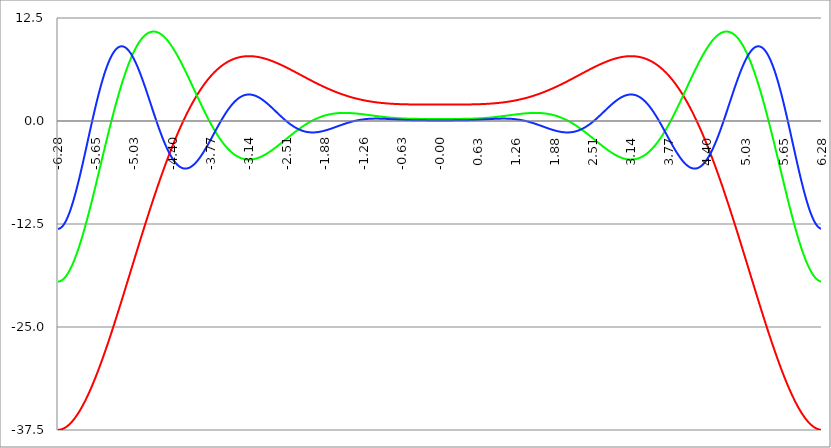
| Category | Series 1 | Series 0 | Series 2 |
|---|---|---|---|
| -6.283185307179586 | -37.478 | -19.489 | -13.085 |
| -6.276902121872407 | -37.478 | -19.488 | -13.083 |
| -6.270618936565228 | -37.475 | -19.483 | -13.076 |
| -6.264335751258049 | -37.471 | -19.475 | -13.064 |
| -6.25805256595087 | -37.466 | -19.464 | -13.048 |
| -6.25176938064369 | -37.459 | -19.451 | -13.027 |
| -6.245486195336511 | -37.451 | -19.434 | -13.002 |
| -6.23920301002933 | -37.441 | -19.414 | -12.972 |
| -6.232919824722153 | -37.429 | -19.391 | -12.938 |
| -6.226636639414973 | -37.416 | -19.365 | -12.899 |
| -6.220353454107794 | -37.402 | -19.336 | -12.855 |
| -6.214070268800615 | -37.386 | -19.304 | -12.808 |
| -6.207787083493435 | -37.368 | -19.269 | -12.756 |
| -6.201503898186257 | -37.349 | -19.231 | -12.699 |
| -6.195220712879077 | -37.329 | -19.19 | -12.638 |
| -6.188937527571898 | -37.307 | -19.147 | -12.573 |
| -6.182654342264719 | -37.283 | -19.1 | -12.504 |
| -6.17637115695754 | -37.258 | -19.051 | -12.431 |
| -6.170087971650361 | -37.232 | -18.998 | -12.353 |
| -6.163804786343182 | -37.204 | -18.943 | -12.271 |
| -6.157521601036002 | -37.175 | -18.885 | -12.186 |
| -6.151238415728823 | -37.145 | -18.825 | -12.096 |
| -6.144955230421644 | -37.113 | -18.761 | -12.002 |
| -6.138672045114464 | -37.079 | -18.695 | -11.905 |
| -6.132388859807286 | -37.045 | -18.626 | -11.803 |
| -6.126105674500106 | -37.008 | -18.555 | -11.698 |
| -6.119822489192927 | -36.971 | -18.481 | -11.589 |
| -6.113539303885748 | -36.932 | -18.404 | -11.477 |
| -6.107256118578569 | -36.892 | -18.324 | -11.361 |
| -6.10097293327139 | -36.85 | -18.242 | -11.241 |
| -6.09468974796421 | -36.807 | -18.158 | -11.117 |
| -6.088406562657031 | -36.762 | -18.071 | -10.991 |
| -6.082123377349852 | -36.717 | -17.981 | -10.86 |
| -6.075840192042672 | -36.67 | -17.889 | -10.727 |
| -6.069557006735494 | -36.621 | -17.794 | -10.59 |
| -6.063273821428314 | -36.571 | -17.697 | -10.45 |
| -6.056990636121135 | -36.52 | -17.597 | -10.307 |
| -6.050707450813956 | -36.468 | -17.495 | -10.161 |
| -6.044424265506777 | -36.414 | -17.391 | -10.012 |
| -6.038141080199597 | -36.359 | -17.284 | -9.859 |
| -6.031857894892418 | -36.303 | -17.175 | -9.704 |
| -6.025574709585239 | -36.246 | -17.064 | -9.546 |
| -6.01929152427806 | -36.187 | -16.951 | -9.386 |
| -6.013008338970881 | -36.127 | -16.835 | -9.223 |
| -6.006725153663701 | -36.066 | -16.717 | -9.057 |
| -6.000441968356522 | -36.003 | -16.597 | -8.888 |
| -5.994158783049343 | -35.939 | -16.474 | -8.717 |
| -5.987875597742164 | -35.875 | -16.35 | -8.544 |
| -5.981592412434984 | -35.808 | -16.223 | -8.368 |
| -5.975309227127805 | -35.741 | -16.095 | -8.19 |
| -5.969026041820626 | -35.672 | -15.964 | -8.01 |
| -5.962742856513447 | -35.603 | -15.832 | -7.828 |
| -5.956459671206268 | -35.532 | -15.697 | -7.644 |
| -5.950176485899088 | -35.46 | -15.561 | -7.458 |
| -5.94389330059191 | -35.386 | -15.422 | -7.27 |
| -5.93761011528473 | -35.312 | -15.282 | -7.08 |
| -5.931326929977551 | -35.236 | -15.14 | -6.889 |
| -5.925043744670372 | -35.159 | -14.996 | -6.695 |
| -5.918760559363193 | -35.082 | -14.85 | -6.501 |
| -5.912477374056014 | -35.003 | -14.703 | -6.305 |
| -5.906194188748834 | -34.922 | -14.554 | -6.107 |
| -5.899911003441655 | -34.841 | -14.403 | -5.908 |
| -5.893627818134476 | -34.759 | -14.25 | -5.708 |
| -5.887344632827297 | -34.675 | -14.096 | -5.506 |
| -5.881061447520117 | -34.591 | -13.94 | -5.304 |
| -5.874778262212938 | -34.505 | -13.783 | -5.1 |
| -5.868495076905759 | -34.419 | -13.624 | -4.896 |
| -5.86221189159858 | -34.331 | -13.464 | -4.69 |
| -5.855928706291401 | -34.242 | -13.302 | -4.484 |
| -5.849645520984221 | -34.152 | -13.139 | -4.277 |
| -5.843362335677042 | -34.062 | -12.974 | -4.07 |
| -5.837079150369863 | -33.97 | -12.808 | -3.862 |
| -5.830795965062684 | -33.877 | -12.641 | -3.653 |
| -5.824512779755505 | -33.783 | -12.472 | -3.444 |
| -5.818229594448325 | -33.688 | -12.302 | -3.235 |
| -5.811946409141146 | -33.592 | -12.131 | -3.025 |
| -5.805663223833967 | -33.495 | -11.959 | -2.816 |
| -5.799380038526788 | -33.398 | -11.786 | -2.606 |
| -5.793096853219609 | -33.299 | -11.611 | -2.396 |
| -5.78681366791243 | -33.199 | -11.435 | -2.186 |
| -5.780530482605251 | -33.098 | -11.259 | -1.977 |
| -5.774247297298071 | -32.997 | -11.081 | -1.767 |
| -5.767964111990892 | -32.894 | -10.902 | -1.558 |
| -5.761680926683713 | -32.791 | -10.722 | -1.349 |
| -5.755397741376534 | -32.686 | -10.542 | -1.141 |
| -5.749114556069355 | -32.581 | -10.36 | -0.933 |
| -5.742831370762175 | -32.475 | -10.178 | -0.726 |
| -5.736548185454996 | -32.368 | -9.994 | -0.519 |
| -5.730265000147816 | -32.26 | -9.81 | -0.313 |
| -5.723981814840638 | -32.151 | -9.626 | -0.108 |
| -5.717698629533459 | -32.042 | -9.44 | 0.096 |
| -5.711415444226279 | -31.931 | -9.254 | 0.299 |
| -5.7051322589191 | -31.82 | -9.067 | 0.502 |
| -5.698849073611921 | -31.708 | -8.88 | 0.703 |
| -5.692565888304742 | -31.595 | -8.692 | 0.903 |
| -5.686282702997562 | -31.481 | -8.503 | 1.102 |
| -5.679999517690383 | -31.366 | -8.314 | 1.299 |
| -5.673716332383204 | -31.251 | -8.124 | 1.496 |
| -5.667433147076025 | -31.135 | -7.934 | 1.691 |
| -5.661149961768846 | -31.018 | -7.743 | 1.884 |
| -5.654866776461667 | -30.9 | -7.553 | 2.076 |
| -5.648583591154487 | -30.782 | -7.361 | 2.266 |
| -5.642300405847308 | -30.662 | -7.17 | 2.455 |
| -5.63601722054013 | -30.542 | -6.978 | 2.642 |
| -5.62973403523295 | -30.422 | -6.786 | 2.827 |
| -5.623450849925771 | -30.3 | -6.593 | 3.01 |
| -5.617167664618591 | -30.178 | -6.401 | 3.191 |
| -5.610884479311412 | -30.055 | -6.208 | 3.371 |
| -5.604601294004233 | -29.932 | -6.015 | 3.548 |
| -5.598318108697054 | -29.807 | -5.822 | 3.724 |
| -5.592034923389875 | -29.683 | -5.629 | 3.897 |
| -5.585751738082695 | -29.557 | -5.436 | 4.068 |
| -5.579468552775516 | -29.431 | -5.243 | 4.237 |
| -5.573185367468337 | -29.304 | -5.05 | 4.403 |
| -5.566902182161157 | -29.176 | -4.858 | 4.568 |
| -5.560618996853979 | -29.048 | -4.665 | 4.73 |
| -5.5543358115468 | -28.919 | -4.472 | 4.889 |
| -5.54805262623962 | -28.79 | -4.28 | 5.046 |
| -5.54176944093244 | -28.66 | -4.087 | 5.201 |
| -5.535486255625262 | -28.529 | -3.895 | 5.353 |
| -5.529203070318083 | -28.398 | -3.703 | 5.502 |
| -5.522919885010904 | -28.266 | -3.512 | 5.649 |
| -5.516636699703724 | -28.134 | -3.32 | 5.793 |
| -5.510353514396545 | -28.001 | -3.13 | 5.934 |
| -5.504070329089366 | -27.868 | -2.939 | 6.072 |
| -5.497787143782186 | -27.734 | -2.749 | 6.208 |
| -5.491503958475008 | -27.599 | -2.559 | 6.341 |
| -5.485220773167828 | -27.464 | -2.37 | 6.471 |
| -5.47893758786065 | -27.328 | -2.181 | 6.598 |
| -5.47265440255347 | -27.192 | -1.993 | 6.722 |
| -5.466371217246291 | -27.056 | -1.805 | 6.843 |
| -5.460088031939112 | -26.919 | -1.618 | 6.961 |
| -5.453804846631932 | -26.781 | -1.432 | 7.077 |
| -5.447521661324753 | -26.643 | -1.246 | 7.189 |
| -5.441238476017574 | -26.504 | -1.061 | 7.298 |
| -5.434955290710395 | -26.365 | -0.876 | 7.404 |
| -5.428672105403215 | -26.226 | -0.693 | 7.506 |
| -5.422388920096036 | -26.086 | -0.509 | 7.606 |
| -5.416105734788857 | -25.946 | -0.327 | 7.702 |
| -5.409822549481678 | -25.805 | -0.146 | 7.795 |
| -5.403539364174499 | -25.664 | 0.035 | 7.885 |
| -5.39725617886732 | -25.522 | 0.215 | 7.972 |
| -5.39097299356014 | -25.38 | 0.394 | 8.056 |
| -5.384689808252961 | -25.238 | 0.572 | 8.136 |
| -5.378406622945782 | -25.095 | 0.749 | 8.213 |
| -5.372123437638603 | -24.952 | 0.925 | 8.287 |
| -5.365840252331424 | -24.809 | 1.1 | 8.357 |
| -5.359557067024244 | -24.665 | 1.274 | 8.424 |
| -5.353273881717065 | -24.521 | 1.447 | 8.488 |
| -5.346990696409886 | -24.376 | 1.619 | 8.548 |
| -5.340707511102707 | -24.231 | 1.79 | 8.605 |
| -5.334424325795528 | -24.086 | 1.96 | 8.659 |
| -5.328141140488348 | -23.941 | 2.129 | 8.709 |
| -5.32185795518117 | -23.795 | 2.296 | 8.756 |
| -5.31557476987399 | -23.649 | 2.463 | 8.8 |
| -5.30929158456681 | -23.503 | 2.628 | 8.84 |
| -5.303008399259631 | -23.356 | 2.792 | 8.877 |
| -5.296725213952453 | -23.209 | 2.955 | 8.911 |
| -5.290442028645273 | -23.062 | 3.117 | 8.941 |
| -5.284158843338094 | -22.914 | 3.277 | 8.968 |
| -5.277875658030915 | -22.767 | 3.436 | 8.992 |
| -5.271592472723735 | -22.619 | 3.594 | 9.012 |
| -5.265309287416557 | -22.471 | 3.75 | 9.029 |
| -5.259026102109377 | -22.322 | 3.905 | 9.043 |
| -5.252742916802198 | -22.174 | 4.059 | 9.053 |
| -5.246459731495019 | -22.025 | 4.211 | 9.06 |
| -5.24017654618784 | -21.876 | 4.362 | 9.064 |
| -5.23389336088066 | -21.727 | 4.511 | 9.064 |
| -5.227610175573481 | -21.578 | 4.659 | 9.062 |
| -5.221326990266302 | -21.428 | 4.806 | 9.056 |
| -5.215043804959122 | -21.279 | 4.951 | 9.047 |
| -5.208760619651944 | -21.129 | 5.094 | 9.034 |
| -5.202477434344764 | -20.979 | 5.236 | 9.019 |
| -5.196194249037585 | -20.829 | 5.377 | 9 |
| -5.189911063730406 | -20.678 | 5.516 | 8.978 |
| -5.183627878423227 | -20.528 | 5.653 | 8.953 |
| -5.177344693116048 | -20.378 | 5.789 | 8.925 |
| -5.171061507808868 | -20.227 | 5.923 | 8.894 |
| -5.164778322501689 | -20.076 | 6.056 | 8.86 |
| -5.15849513719451 | -19.925 | 6.187 | 8.823 |
| -5.152211951887331 | -19.775 | 6.316 | 8.783 |
| -5.145928766580152 | -19.624 | 6.444 | 8.74 |
| -5.139645581272972 | -19.473 | 6.57 | 8.695 |
| -5.133362395965793 | -19.322 | 6.694 | 8.646 |
| -5.127079210658614 | -19.17 | 6.817 | 8.594 |
| -5.120796025351435 | -19.019 | 6.938 | 8.54 |
| -5.114512840044256 | -18.868 | 7.057 | 8.483 |
| -5.108229654737076 | -18.717 | 7.174 | 8.423 |
| -5.101946469429897 | -18.565 | 7.29 | 8.36 |
| -5.095663284122718 | -18.414 | 7.404 | 8.295 |
| -5.08938009881554 | -18.263 | 7.517 | 8.227 |
| -5.08309691350836 | -18.111 | 7.627 | 8.156 |
| -5.07681372820118 | -17.96 | 7.736 | 8.083 |
| -5.070530542894002 | -17.809 | 7.843 | 8.007 |
| -5.064247357586822 | -17.658 | 7.948 | 7.929 |
| -5.057964172279643 | -17.506 | 8.051 | 7.849 |
| -5.051680986972464 | -17.355 | 8.153 | 7.766 |
| -5.045397801665285 | -17.204 | 8.253 | 7.68 |
| -5.039114616358106 | -17.053 | 8.351 | 7.592 |
| -5.032831431050926 | -16.902 | 8.447 | 7.502 |
| -5.026548245743747 | -16.751 | 8.541 | 7.41 |
| -5.020265060436568 | -16.6 | 8.633 | 7.316 |
| -5.013981875129389 | -16.449 | 8.724 | 7.219 |
| -5.00769868982221 | -16.298 | 8.812 | 7.121 |
| -5.00141550451503 | -16.147 | 8.899 | 7.02 |
| -4.995132319207851 | -15.997 | 8.984 | 6.917 |
| -4.98884913390067 | -15.846 | 9.067 | 6.813 |
| -4.982565948593493 | -15.696 | 9.148 | 6.706 |
| -4.976282763286313 | -15.546 | 9.228 | 6.598 |
| -4.969999577979134 | -15.396 | 9.305 | 6.487 |
| -4.963716392671955 | -15.246 | 9.381 | 6.375 |
| -4.957433207364776 | -15.096 | 9.454 | 6.262 |
| -4.951150022057597 | -14.946 | 9.526 | 6.146 |
| -4.944866836750418 | -14.796 | 9.596 | 6.029 |
| -4.938583651443238 | -14.647 | 9.664 | 5.911 |
| -4.932300466136059 | -14.498 | 9.73 | 5.791 |
| -4.92601728082888 | -14.349 | 9.794 | 5.669 |
| -4.9197340955217 | -14.2 | 9.856 | 5.546 |
| -4.913450910214521 | -14.051 | 9.917 | 5.422 |
| -4.907167724907342 | -13.902 | 9.975 | 5.297 |
| -4.900884539600163 | -13.754 | 10.031 | 5.17 |
| -4.894601354292984 | -13.606 | 10.086 | 5.042 |
| -4.888318168985805 | -13.458 | 10.139 | 4.913 |
| -4.882034983678625 | -13.31 | 10.19 | 4.782 |
| -4.875751798371446 | -13.163 | 10.238 | 4.651 |
| -4.869468613064267 | -13.015 | 10.285 | 4.519 |
| -4.863185427757088 | -12.868 | 10.331 | 4.386 |
| -4.856902242449909 | -12.722 | 10.374 | 4.252 |
| -4.85061905714273 | -12.575 | 10.415 | 4.117 |
| -4.84433587183555 | -12.429 | 10.454 | 3.981 |
| -4.838052686528371 | -12.283 | 10.492 | 3.845 |
| -4.831769501221192 | -12.137 | 10.528 | 3.707 |
| -4.825486315914013 | -11.991 | 10.561 | 3.57 |
| -4.819203130606833 | -11.846 | 10.593 | 3.432 |
| -4.812919945299654 | -11.701 | 10.623 | 3.293 |
| -4.806636759992475 | -11.557 | 10.651 | 3.154 |
| -4.800353574685296 | -11.412 | 10.678 | 3.014 |
| -4.794070389378117 | -11.268 | 10.702 | 2.874 |
| -4.787787204070938 | -11.124 | 10.725 | 2.734 |
| -4.781504018763758 | -10.981 | 10.745 | 2.593 |
| -4.77522083345658 | -10.838 | 10.764 | 2.453 |
| -4.7689376481494 | -10.695 | 10.781 | 2.312 |
| -4.762654462842221 | -10.552 | 10.796 | 2.171 |
| -4.756371277535042 | -10.41 | 10.81 | 2.03 |
| -4.750088092227862 | -10.268 | 10.821 | 1.889 |
| -4.743804906920683 | -10.127 | 10.831 | 1.748 |
| -4.737521721613504 | -9.986 | 10.839 | 1.608 |
| -4.731238536306324 | -9.845 | 10.845 | 1.467 |
| -4.724955350999146 | -9.705 | 10.85 | 1.327 |
| -4.718672165691966 | -9.564 | 10.852 | 1.187 |
| -4.712388980384787 | -9.425 | 10.853 | 1.047 |
| -4.706105795077608 | -9.285 | 10.852 | 0.908 |
| -4.699822609770429 | -9.146 | 10.85 | 0.769 |
| -4.69353942446325 | -9.008 | 10.845 | 0.631 |
| -4.68725623915607 | -8.87 | 10.839 | 0.493 |
| -4.680973053848891 | -8.732 | 10.832 | 0.355 |
| -4.674689868541712 | -8.594 | 10.822 | 0.218 |
| -4.668406683234533 | -8.457 | 10.811 | 0.082 |
| -4.662123497927354 | -8.321 | 10.798 | -0.053 |
| -4.655840312620174 | -8.185 | 10.783 | -0.188 |
| -4.649557127312995 | -8.049 | 10.767 | -0.321 |
| -4.643273942005816 | -7.914 | 10.749 | -0.454 |
| -4.636990756698637 | -7.779 | 10.73 | -0.587 |
| -4.630707571391458 | -7.644 | 10.709 | -0.718 |
| -4.624424386084279 | -7.51 | 10.686 | -0.848 |
| -4.618141200777099 | -7.376 | 10.662 | -0.977 |
| -4.61185801546992 | -7.243 | 10.636 | -1.105 |
| -4.605574830162741 | -7.111 | 10.608 | -1.232 |
| -4.599291644855561 | -6.978 | 10.579 | -1.358 |
| -4.593008459548383 | -6.846 | 10.549 | -1.483 |
| -4.586725274241203 | -6.715 | 10.517 | -1.607 |
| -4.580442088934024 | -6.584 | 10.483 | -1.729 |
| -4.574158903626845 | -6.454 | 10.448 | -1.85 |
| -4.567875718319666 | -6.324 | 10.411 | -1.969 |
| -4.561592533012487 | -6.194 | 10.373 | -2.088 |
| -4.555309347705307 | -6.065 | 10.334 | -2.205 |
| -4.549026162398128 | -5.937 | 10.293 | -2.32 |
| -4.542742977090949 | -5.809 | 10.25 | -2.434 |
| -4.53645979178377 | -5.681 | 10.206 | -2.547 |
| -4.530176606476591 | -5.554 | 10.161 | -2.657 |
| -4.523893421169412 | -5.427 | 10.114 | -2.767 |
| -4.517610235862232 | -5.301 | 10.066 | -2.875 |
| -4.511327050555053 | -5.176 | 10.017 | -2.981 |
| -4.505043865247874 | -5.051 | 9.966 | -3.085 |
| -4.498760679940694 | -4.926 | 9.914 | -3.188 |
| -4.492477494633515 | -4.802 | 9.861 | -3.289 |
| -4.486194309326336 | -4.679 | 9.806 | -3.388 |
| -4.479911124019157 | -4.556 | 9.75 | -3.486 |
| -4.473627938711977 | -4.433 | 9.693 | -3.582 |
| -4.467344753404799 | -4.311 | 9.635 | -3.676 |
| -4.46106156809762 | -4.19 | 9.575 | -3.768 |
| -4.45477838279044 | -4.069 | 9.514 | -3.858 |
| -4.44849519748326 | -3.949 | 9.452 | -3.946 |
| -4.442212012176082 | -3.829 | 9.389 | -4.033 |
| -4.435928826868903 | -3.71 | 9.325 | -4.117 |
| -4.429645641561723 | -3.591 | 9.259 | -4.2 |
| -4.423362456254544 | -3.473 | 9.193 | -4.28 |
| -4.417079270947365 | -3.356 | 9.125 | -4.359 |
| -4.410796085640185 | -3.239 | 9.056 | -4.435 |
| -4.404512900333007 | -3.122 | 8.986 | -4.51 |
| -4.398229715025827 | -3.006 | 8.915 | -4.582 |
| -4.391946529718648 | -2.891 | 8.843 | -4.653 |
| -4.38566334441147 | -2.776 | 8.77 | -4.721 |
| -4.37938015910429 | -2.662 | 8.696 | -4.787 |
| -4.373096973797111 | -2.548 | 8.622 | -4.851 |
| -4.366813788489932 | -2.435 | 8.546 | -4.913 |
| -4.360530603182752 | -2.323 | 8.469 | -4.973 |
| -4.354247417875573 | -2.211 | 8.391 | -5.031 |
| -4.347964232568394 | -2.1 | 8.312 | -5.087 |
| -4.341681047261215 | -1.989 | 8.233 | -5.14 |
| -4.335397861954035 | -1.879 | 8.152 | -5.192 |
| -4.329114676646856 | -1.769 | 8.071 | -5.241 |
| -4.322831491339677 | -1.661 | 7.989 | -5.288 |
| -4.316548306032498 | -1.552 | 7.906 | -5.333 |
| -4.310265120725319 | -1.445 | 7.822 | -5.376 |
| -4.30398193541814 | -1.337 | 7.738 | -5.416 |
| -4.29769875011096 | -1.231 | 7.653 | -5.454 |
| -4.291415564803781 | -1.125 | 7.567 | -5.491 |
| -4.285132379496602 | -1.02 | 7.48 | -5.524 |
| -4.278849194189422 | -0.915 | 7.393 | -5.556 |
| -4.272566008882244 | -0.811 | 7.305 | -5.586 |
| -4.266282823575064 | -0.707 | 7.216 | -5.613 |
| -4.259999638267885 | -0.605 | 7.127 | -5.639 |
| -4.253716452960706 | -0.502 | 7.037 | -5.662 |
| -4.247433267653527 | -0.401 | 6.946 | -5.683 |
| -4.241150082346347 | -0.3 | 6.855 | -5.701 |
| -4.234866897039168 | -0.199 | 6.763 | -5.718 |
| -4.228583711731989 | -0.1 | 6.671 | -5.732 |
| -4.22230052642481 | 0 | 6.578 | -5.745 |
| -4.216017341117631 | 0.098 | 6.485 | -5.755 |
| -4.209734155810452 | 0.196 | 6.391 | -5.763 |
| -4.203450970503273 | 0.293 | 6.297 | -5.769 |
| -4.197167785196093 | 0.39 | 6.202 | -5.773 |
| -4.190884599888914 | 0.486 | 6.107 | -5.774 |
| -4.184601414581734 | 0.581 | 6.012 | -5.774 |
| -4.178318229274556 | 0.676 | 5.916 | -5.772 |
| -4.172035043967377 | 0.77 | 5.819 | -5.767 |
| -4.165751858660197 | 0.864 | 5.723 | -5.761 |
| -4.159468673353018 | 0.956 | 5.626 | -5.752 |
| -4.153185488045839 | 1.049 | 5.528 | -5.742 |
| -4.14690230273866 | 1.14 | 5.431 | -5.729 |
| -4.140619117431481 | 1.231 | 5.333 | -5.715 |
| -4.134335932124301 | 1.321 | 5.235 | -5.698 |
| -4.128052746817122 | 1.411 | 5.136 | -5.68 |
| -4.121769561509943 | 1.5 | 5.038 | -5.659 |
| -4.115486376202764 | 1.588 | 4.939 | -5.637 |
| -4.109203190895584 | 1.676 | 4.84 | -5.613 |
| -4.102920005588405 | 1.763 | 4.74 | -5.587 |
| -4.096636820281226 | 1.849 | 4.641 | -5.559 |
| -4.090353634974047 | 1.935 | 4.542 | -5.529 |
| -4.084070449666868 | 2.02 | 4.442 | -5.498 |
| -4.077787264359689 | 2.105 | 4.342 | -5.464 |
| -4.071504079052509 | 2.189 | 4.242 | -5.429 |
| -4.06522089374533 | 2.272 | 4.143 | -5.393 |
| -4.058937708438151 | 2.354 | 4.043 | -5.354 |
| -4.052654523130972 | 2.436 | 3.943 | -5.314 |
| -4.046371337823793 | 2.517 | 3.843 | -5.272 |
| -4.040088152516613 | 2.598 | 3.743 | -5.229 |
| -4.033804967209434 | 2.678 | 3.643 | -5.184 |
| -4.027521781902255 | 2.757 | 3.543 | -5.137 |
| -4.021238596595076 | 2.836 | 3.443 | -5.089 |
| -4.014955411287897 | 2.914 | 3.343 | -5.039 |
| -4.008672225980717 | 2.991 | 3.244 | -4.988 |
| -4.002389040673538 | 3.068 | 3.144 | -4.935 |
| -3.996105855366359 | 3.144 | 3.045 | -4.881 |
| -3.989822670059179 | 3.219 | 2.945 | -4.826 |
| -3.983539484752 | 3.294 | 2.846 | -4.769 |
| -3.97725629944482 | 3.368 | 2.747 | -4.711 |
| -3.97097311413764 | 3.441 | 2.648 | -4.651 |
| -3.96468992883046 | 3.514 | 2.55 | -4.59 |
| -3.958406743523281 | 3.586 | 2.452 | -4.528 |
| -3.952123558216101 | 3.657 | 2.353 | -4.465 |
| -3.945840372908922 | 3.728 | 2.256 | -4.4 |
| -3.939557187601742 | 3.798 | 2.158 | -4.334 |
| -3.933274002294562 | 3.868 | 2.061 | -4.267 |
| -3.926990816987382 | 3.937 | 1.963 | -4.2 |
| -3.920707631680203 | 4.005 | 1.867 | -4.13 |
| -3.914424446373023 | 4.072 | 1.77 | -4.06 |
| -3.908141261065844 | 4.139 | 1.674 | -3.989 |
| -3.901858075758664 | 4.206 | 1.579 | -3.917 |
| -3.895574890451484 | 4.271 | 1.483 | -3.844 |
| -3.889291705144305 | 4.336 | 1.388 | -3.77 |
| -3.883008519837125 | 4.4 | 1.294 | -3.696 |
| -3.876725334529945 | 4.464 | 1.199 | -3.62 |
| -3.870442149222766 | 4.527 | 1.106 | -3.543 |
| -3.864158963915586 | 4.589 | 1.012 | -3.466 |
| -3.857875778608407 | 4.651 | 0.92 | -3.388 |
| -3.851592593301227 | 4.712 | 0.827 | -3.31 |
| -3.845309407994047 | 4.773 | 0.735 | -3.23 |
| -3.839026222686868 | 4.832 | 0.644 | -3.15 |
| -3.832743037379688 | 4.892 | 0.553 | -3.07 |
| -3.826459852072508 | 4.95 | 0.463 | -2.988 |
| -3.820176666765329 | 5.008 | 0.373 | -2.907 |
| -3.813893481458149 | 5.065 | 0.283 | -2.825 |
| -3.807610296150969 | 5.122 | 0.195 | -2.742 |
| -3.80132711084379 | 5.178 | 0.106 | -2.659 |
| -3.79504392553661 | 5.233 | 0.019 | -2.575 |
| -3.78876074022943 | 5.288 | -0.068 | -2.491 |
| -3.782477554922251 | 5.342 | -0.155 | -2.407 |
| -3.776194369615071 | 5.395 | -0.241 | -2.323 |
| -3.769911184307892 | 5.448 | -0.326 | -2.238 |
| -3.763627999000712 | 5.5 | -0.411 | -2.153 |
| -3.757344813693532 | 5.552 | -0.495 | -2.068 |
| -3.751061628386352 | 5.603 | -0.578 | -1.982 |
| -3.744778443079173 | 5.653 | -0.661 | -1.897 |
| -3.738495257771993 | 5.703 | -0.743 | -1.811 |
| -3.732212072464814 | 5.752 | -0.824 | -1.725 |
| -3.725928887157634 | 5.8 | -0.904 | -1.639 |
| -3.719645701850454 | 5.848 | -0.984 | -1.554 |
| -3.713362516543275 | 5.895 | -1.064 | -1.468 |
| -3.707079331236095 | 5.942 | -1.142 | -1.382 |
| -3.700796145928915 | 5.988 | -1.22 | -1.297 |
| -3.694512960621736 | 6.033 | -1.297 | -1.211 |
| -3.688229775314556 | 6.078 | -1.373 | -1.126 |
| -3.681946590007376 | 6.122 | -1.449 | -1.041 |
| -3.675663404700197 | 6.165 | -1.523 | -0.956 |
| -3.669380219393017 | 6.208 | -1.597 | -0.871 |
| -3.663097034085838 | 6.251 | -1.671 | -0.786 |
| -3.656813848778658 | 6.292 | -1.743 | -0.702 |
| -3.650530663471478 | 6.333 | -1.815 | -0.618 |
| -3.644247478164299 | 6.374 | -1.886 | -0.535 |
| -3.63796429285712 | 6.414 | -1.956 | -0.452 |
| -3.631681107549939 | 6.453 | -2.025 | -0.369 |
| -3.62539792224276 | 6.492 | -2.093 | -0.287 |
| -3.61911473693558 | 6.53 | -2.161 | -0.205 |
| -3.612831551628401 | 6.568 | -2.228 | -0.124 |
| -3.606548366321221 | 6.604 | -2.294 | -0.043 |
| -3.600265181014041 | 6.641 | -2.359 | 0.037 |
| -3.593981995706862 | 6.677 | -2.423 | 0.117 |
| -3.587698810399682 | 6.712 | -2.486 | 0.196 |
| -3.581415625092502 | 6.746 | -2.549 | 0.274 |
| -3.575132439785323 | 6.78 | -2.611 | 0.352 |
| -3.568849254478143 | 6.814 | -2.671 | 0.429 |
| -3.562566069170964 | 6.847 | -2.731 | 0.505 |
| -3.556282883863784 | 6.879 | -2.79 | 0.581 |
| -3.549999698556604 | 6.911 | -2.848 | 0.656 |
| -3.543716513249425 | 6.942 | -2.906 | 0.73 |
| -3.537433327942245 | 6.973 | -2.962 | 0.803 |
| -3.531150142635065 | 7.003 | -3.018 | 0.876 |
| -3.524866957327886 | 7.032 | -3.072 | 0.947 |
| -3.518583772020706 | 7.061 | -3.126 | 1.018 |
| -3.512300586713526 | 7.089 | -3.179 | 1.088 |
| -3.506017401406347 | 7.117 | -3.231 | 1.157 |
| -3.499734216099167 | 7.144 | -3.282 | 1.225 |
| -3.493451030791987 | 7.171 | -3.332 | 1.292 |
| -3.487167845484808 | 7.197 | -3.381 | 1.359 |
| -3.480884660177628 | 7.223 | -3.429 | 1.424 |
| -3.474601474870449 | 7.248 | -3.476 | 1.488 |
| -3.468318289563269 | 7.272 | -3.523 | 1.552 |
| -3.462035104256089 | 7.296 | -3.568 | 1.614 |
| -3.45575191894891 | 7.32 | -3.613 | 1.675 |
| -3.44946873364173 | 7.343 | -3.656 | 1.735 |
| -3.44318554833455 | 7.365 | -3.699 | 1.794 |
| -3.436902363027371 | 7.387 | -3.741 | 1.852 |
| -3.430619177720191 | 7.408 | -3.782 | 1.909 |
| -3.424335992413011 | 7.429 | -3.822 | 1.965 |
| -3.418052807105832 | 7.449 | -3.861 | 2.02 |
| -3.411769621798652 | 7.469 | -3.899 | 2.073 |
| -3.405486436491473 | 7.489 | -3.936 | 2.126 |
| -3.399203251184293 | 7.507 | -3.972 | 2.177 |
| -3.392920065877113 | 7.526 | -4.008 | 2.227 |
| -3.386636880569934 | 7.543 | -4.042 | 2.276 |
| -3.380353695262754 | 7.56 | -4.075 | 2.324 |
| -3.374070509955574 | 7.577 | -4.108 | 2.37 |
| -3.367787324648395 | 7.593 | -4.14 | 2.416 |
| -3.361504139341215 | 7.609 | -4.17 | 2.46 |
| -3.355220954034035 | 7.624 | -4.2 | 2.503 |
| -3.348937768726855 | 7.639 | -4.229 | 2.544 |
| -3.342654583419676 | 7.653 | -4.257 | 2.585 |
| -3.336371398112496 | 7.667 | -4.284 | 2.624 |
| -3.330088212805317 | 7.68 | -4.31 | 2.662 |
| -3.323805027498137 | 7.693 | -4.335 | 2.699 |
| -3.317521842190957 | 7.706 | -4.359 | 2.734 |
| -3.311238656883778 | 7.718 | -4.383 | 2.768 |
| -3.304955471576598 | 7.729 | -4.405 | 2.801 |
| -3.298672286269419 | 7.74 | -4.427 | 2.833 |
| -3.292389100962239 | 7.75 | -4.448 | 2.863 |
| -3.286105915655059 | 7.76 | -4.467 | 2.893 |
| -3.27982273034788 | 7.77 | -4.486 | 2.92 |
| -3.2735395450407 | 7.779 | -4.504 | 2.947 |
| -3.26725635973352 | 7.788 | -4.521 | 2.972 |
| -3.260973174426341 | 7.796 | -4.538 | 2.996 |
| -3.254689989119161 | 7.803 | -4.553 | 3.019 |
| -3.248406803811982 | 7.811 | -4.567 | 3.041 |
| -3.242123618504802 | 7.818 | -4.581 | 3.061 |
| -3.235840433197622 | 7.824 | -4.594 | 3.08 |
| -3.229557247890442 | 7.83 | -4.606 | 3.098 |
| -3.223274062583263 | 7.836 | -4.617 | 3.114 |
| -3.216990877276083 | 7.841 | -4.627 | 3.129 |
| -3.210707691968904 | 7.845 | -4.636 | 3.143 |
| -3.204424506661724 | 7.85 | -4.645 | 3.156 |
| -3.198141321354544 | 7.853 | -4.653 | 3.167 |
| -3.191858136047365 | 7.857 | -4.659 | 3.178 |
| -3.185574950740185 | 7.86 | -4.665 | 3.187 |
| -3.179291765433005 | 7.862 | -4.671 | 3.194 |
| -3.173008580125826 | 7.865 | -4.675 | 3.201 |
| -3.166725394818646 | 7.866 | -4.679 | 3.206 |
| -3.160442209511467 | 7.868 | -4.681 | 3.21 |
| -3.154159024204287 | 7.869 | -4.683 | 3.213 |
| -3.147875838897107 | 7.869 | -4.684 | 3.215 |
| -3.141592653589928 | 7.87 | -4.685 | 3.216 |
| -3.135309468282748 | 7.869 | -4.684 | 3.215 |
| -3.129026282975568 | 7.869 | -4.683 | 3.213 |
| -3.122743097668389 | 7.868 | -4.681 | 3.211 |
| -3.116459912361209 | 7.867 | -4.679 | 3.207 |
| -3.110176727054029 | 7.865 | -4.675 | 3.201 |
| -3.10389354174685 | 7.863 | -4.671 | 3.195 |
| -3.09761035643967 | 7.86 | -4.666 | 3.188 |
| -3.09132717113249 | 7.857 | -4.66 | 3.179 |
| -3.085043985825311 | 7.854 | -4.654 | 3.17 |
| -3.078760800518131 | 7.851 | -4.647 | 3.159 |
| -3.072477615210952 | 7.847 | -4.639 | 3.147 |
| -3.066194429903772 | 7.842 | -4.631 | 3.135 |
| -3.059911244596592 | 7.838 | -4.621 | 3.121 |
| -3.053628059289413 | 7.833 | -4.611 | 3.106 |
| -3.047344873982233 | 7.828 | -4.601 | 3.09 |
| -3.041061688675053 | 7.822 | -4.59 | 3.074 |
| -3.034778503367874 | 7.816 | -4.578 | 3.056 |
| -3.028495318060694 | 7.81 | -4.565 | 3.037 |
| -3.022212132753515 | 7.803 | -4.552 | 3.017 |
| -3.015928947446335 | 7.796 | -4.538 | 2.997 |
| -3.009645762139155 | 7.789 | -4.523 | 2.975 |
| -3.003362576831975 | 7.781 | -4.508 | 2.953 |
| -2.997079391524796 | 7.773 | -4.492 | 2.93 |
| -2.990796206217616 | 7.765 | -4.476 | 2.906 |
| -2.984513020910436 | 7.756 | -4.459 | 2.881 |
| -2.978229835603257 | 7.747 | -4.441 | 2.855 |
| -2.971946650296077 | 7.738 | -4.423 | 2.828 |
| -2.965663464988898 | 7.728 | -4.405 | 2.801 |
| -2.959380279681718 | 7.719 | -4.385 | 2.772 |
| -2.953097094374538 | 7.708 | -4.365 | 2.743 |
| -2.946813909067359 | 7.698 | -4.345 | 2.714 |
| -2.94053072376018 | 7.687 | -4.324 | 2.683 |
| -2.934247538453 | 7.676 | -4.302 | 2.652 |
| -2.92796435314582 | 7.665 | -4.28 | 2.62 |
| -2.92168116783864 | 7.653 | -4.258 | 2.588 |
| -2.915397982531461 | 7.642 | -4.235 | 2.555 |
| -2.909114797224281 | 7.63 | -4.211 | 2.521 |
| -2.902831611917101 | 7.617 | -4.187 | 2.486 |
| -2.896548426609922 | 7.605 | -4.162 | 2.451 |
| -2.890265241302742 | 7.592 | -4.137 | 2.416 |
| -2.883982055995562 | 7.578 | -4.112 | 2.379 |
| -2.877698870688383 | 7.565 | -4.086 | 2.343 |
| -2.871415685381203 | 7.551 | -4.059 | 2.305 |
| -2.865132500074023 | 7.537 | -4.032 | 2.267 |
| -2.858849314766844 | 7.523 | -4.005 | 2.229 |
| -2.852566129459664 | 7.509 | -3.977 | 2.19 |
| -2.846282944152485 | 7.494 | -3.949 | 2.151 |
| -2.839999758845305 | 7.479 | -3.921 | 2.112 |
| -2.833716573538125 | 7.464 | -3.892 | 2.072 |
| -2.827433388230946 | 7.448 | -3.863 | 2.031 |
| -2.821150202923766 | 7.433 | -3.833 | 1.99 |
| -2.814867017616586 | 7.417 | -3.803 | 1.949 |
| -2.808583832309407 | 7.401 | -3.772 | 1.908 |
| -2.802300647002227 | 7.385 | -3.741 | 1.866 |
| -2.796017461695047 | 7.368 | -3.71 | 1.824 |
| -2.789734276387867 | 7.351 | -3.679 | 1.781 |
| -2.783451091080688 | 7.334 | -3.647 | 1.739 |
| -2.777167905773509 | 7.317 | -3.615 | 1.696 |
| -2.770884720466329 | 7.3 | -3.582 | 1.652 |
| -2.764601535159149 | 7.282 | -3.55 | 1.609 |
| -2.75831834985197 | 7.264 | -3.517 | 1.566 |
| -2.75203516454479 | 7.246 | -3.483 | 1.522 |
| -2.74575197923761 | 7.228 | -3.45 | 1.478 |
| -2.739468793930431 | 7.21 | -3.416 | 1.434 |
| -2.733185608623251 | 7.191 | -3.382 | 1.39 |
| -2.726902423316071 | 7.173 | -3.348 | 1.346 |
| -2.720619238008892 | 7.154 | -3.313 | 1.301 |
| -2.714336052701712 | 7.135 | -3.278 | 1.257 |
| -2.708052867394532 | 7.115 | -3.243 | 1.213 |
| -2.701769682087352 | 7.096 | -3.208 | 1.168 |
| -2.695486496780173 | 7.076 | -3.173 | 1.124 |
| -2.689203311472993 | 7.057 | -3.137 | 1.079 |
| -2.682920126165814 | 7.037 | -3.101 | 1.035 |
| -2.676636940858634 | 7.016 | -3.065 | 0.991 |
| -2.670353755551454 | 6.996 | -3.029 | 0.946 |
| -2.664070570244275 | 6.976 | -2.993 | 0.902 |
| -2.657787384937095 | 6.955 | -2.956 | 0.858 |
| -2.651504199629916 | 6.934 | -2.919 | 0.814 |
| -2.645221014322736 | 6.914 | -2.883 | 0.77 |
| -2.638937829015556 | 6.893 | -2.846 | 0.726 |
| -2.632654643708377 | 6.871 | -2.809 | 0.683 |
| -2.626371458401197 | 6.85 | -2.772 | 0.639 |
| -2.620088273094018 | 6.829 | -2.735 | 0.596 |
| -2.613805087786838 | 6.807 | -2.697 | 0.553 |
| -2.607521902479658 | 6.786 | -2.66 | 0.51 |
| -2.601238717172478 | 6.764 | -2.622 | 0.468 |
| -2.594955531865299 | 6.742 | -2.585 | 0.425 |
| -2.588672346558119 | 6.72 | -2.547 | 0.383 |
| -2.58238916125094 | 6.698 | -2.51 | 0.342 |
| -2.57610597594376 | 6.675 | -2.472 | 0.3 |
| -2.56982279063658 | 6.653 | -2.434 | 0.259 |
| -2.563539605329401 | 6.63 | -2.396 | 0.218 |
| -2.557256420022221 | 6.608 | -2.358 | 0.177 |
| -2.550973234715042 | 6.585 | -2.321 | 0.137 |
| -2.544690049407862 | 6.562 | -2.283 | 0.097 |
| -2.538406864100682 | 6.539 | -2.245 | 0.058 |
| -2.532123678793503 | 6.516 | -2.207 | 0.018 |
| -2.525840493486323 | 6.493 | -2.169 | -0.02 |
| -2.519557308179143 | 6.47 | -2.132 | -0.059 |
| -2.513274122871964 | 6.447 | -2.094 | -0.097 |
| -2.506990937564784 | 6.423 | -2.056 | -0.134 |
| -2.500707752257604 | 6.4 | -2.018 | -0.171 |
| -2.494424566950425 | 6.376 | -1.981 | -0.208 |
| -2.488141381643245 | 6.353 | -1.943 | -0.244 |
| -2.481858196336065 | 6.329 | -1.906 | -0.28 |
| -2.475575011028886 | 6.305 | -1.868 | -0.315 |
| -2.469291825721706 | 6.281 | -1.831 | -0.35 |
| -2.463008640414527 | 6.258 | -1.794 | -0.384 |
| -2.456725455107347 | 6.234 | -1.756 | -0.418 |
| -2.450442269800167 | 6.21 | -1.719 | -0.451 |
| -2.444159084492988 | 6.186 | -1.682 | -0.484 |
| -2.437875899185808 | 6.161 | -1.645 | -0.516 |
| -2.431592713878628 | 6.137 | -1.609 | -0.548 |
| -2.425309528571449 | 6.113 | -1.572 | -0.579 |
| -2.419026343264269 | 6.089 | -1.535 | -0.61 |
| -2.412743157957089 | 6.064 | -1.499 | -0.64 |
| -2.40645997264991 | 6.04 | -1.463 | -0.67 |
| -2.40017678734273 | 6.016 | -1.427 | -0.699 |
| -2.393893602035551 | 5.991 | -1.391 | -0.727 |
| -2.387610416728371 | 5.967 | -1.355 | -0.755 |
| -2.381327231421191 | 5.942 | -1.319 | -0.783 |
| -2.375044046114012 | 5.917 | -1.284 | -0.809 |
| -2.368760860806832 | 5.893 | -1.248 | -0.835 |
| -2.362477675499652 | 5.868 | -1.213 | -0.861 |
| -2.356194490192473 | 5.844 | -1.178 | -0.886 |
| -2.349911304885293 | 5.819 | -1.143 | -0.91 |
| -2.343628119578113 | 5.794 | -1.109 | -0.934 |
| -2.337344934270934 | 5.769 | -1.074 | -0.957 |
| -2.331061748963754 | 5.745 | -1.04 | -0.98 |
| -2.324778563656574 | 5.72 | -1.006 | -1.002 |
| -2.318495378349395 | 5.695 | -0.972 | -1.023 |
| -2.312212193042215 | 5.67 | -0.939 | -1.044 |
| -2.305929007735036 | 5.646 | -0.905 | -1.064 |
| -2.299645822427856 | 5.621 | -0.872 | -1.083 |
| -2.293362637120676 | 5.596 | -0.839 | -1.102 |
| -2.287079451813496 | 5.571 | -0.807 | -1.121 |
| -2.280796266506317 | 5.547 | -0.774 | -1.138 |
| -2.274513081199137 | 5.522 | -0.742 | -1.155 |
| -2.268229895891957 | 5.497 | -0.71 | -1.172 |
| -2.261946710584778 | 5.472 | -0.678 | -1.187 |
| -2.255663525277598 | 5.447 | -0.647 | -1.203 |
| -2.249380339970419 | 5.423 | -0.616 | -1.217 |
| -2.24309715466324 | 5.398 | -0.585 | -1.231 |
| -2.23681396935606 | 5.373 | -0.554 | -1.244 |
| -2.23053078404888 | 5.348 | -0.524 | -1.257 |
| -2.2242475987417 | 5.324 | -0.494 | -1.269 |
| -2.217964413434521 | 5.299 | -0.464 | -1.281 |
| -2.211681228127341 | 5.274 | -0.434 | -1.292 |
| -2.205398042820161 | 5.25 | -0.405 | -1.302 |
| -2.199114857512981 | 5.225 | -0.376 | -1.312 |
| -2.192831672205802 | 5.201 | -0.347 | -1.321 |
| -2.186548486898622 | 5.176 | -0.319 | -1.329 |
| -2.180265301591443 | 5.152 | -0.29 | -1.337 |
| -2.173982116284263 | 5.127 | -0.262 | -1.344 |
| -2.167698930977084 | 5.103 | -0.235 | -1.351 |
| -2.161415745669904 | 5.078 | -0.208 | -1.357 |
| -2.155132560362724 | 5.054 | -0.181 | -1.363 |
| -2.148849375055545 | 5.03 | -0.154 | -1.368 |
| -2.142566189748365 | 5.005 | -0.127 | -1.372 |
| -2.136283004441185 | 4.981 | -0.101 | -1.376 |
| -2.129999819134006 | 4.957 | -0.076 | -1.38 |
| -2.123716633826826 | 4.933 | -0.05 | -1.382 |
| -2.117433448519646 | 4.909 | -0.025 | -1.385 |
| -2.111150263212467 | 4.885 | 0 | -1.386 |
| -2.104867077905287 | 4.861 | 0.025 | -1.387 |
| -2.098583892598107 | 4.837 | 0.049 | -1.388 |
| -2.092300707290928 | 4.813 | 0.073 | -1.388 |
| -2.086017521983748 | 4.789 | 0.096 | -1.388 |
| -2.079734336676569 | 4.765 | 0.12 | -1.387 |
| -2.073451151369389 | 4.742 | 0.143 | -1.385 |
| -2.06716796606221 | 4.718 | 0.165 | -1.383 |
| -2.06088478075503 | 4.694 | 0.187 | -1.381 |
| -2.05460159544785 | 4.671 | 0.209 | -1.378 |
| -2.04831841014067 | 4.647 | 0.231 | -1.375 |
| -2.042035224833491 | 4.624 | 0.253 | -1.371 |
| -2.035752039526311 | 4.601 | 0.274 | -1.366 |
| -2.029468854219131 | 4.578 | 0.294 | -1.362 |
| -2.023185668911951 | 4.554 | 0.315 | -1.356 |
| -2.016902483604772 | 4.531 | 0.335 | -1.351 |
| -2.010619298297592 | 4.508 | 0.354 | -1.345 |
| -2.004336112990412 | 4.485 | 0.374 | -1.338 |
| -1.998052927683233 | 4.462 | 0.393 | -1.331 |
| -1.991769742376054 | 4.44 | 0.412 | -1.324 |
| -1.985486557068874 | 4.417 | 0.43 | -1.316 |
| -1.979203371761694 | 4.394 | 0.448 | -1.308 |
| -1.972920186454515 | 4.372 | 0.466 | -1.299 |
| -1.966637001147335 | 4.349 | 0.483 | -1.29 |
| -1.960353815840155 | 4.327 | 0.501 | -1.281 |
| -1.954070630532976 | 4.305 | 0.517 | -1.272 |
| -1.947787445225796 | 4.282 | 0.534 | -1.262 |
| -1.941504259918616 | 4.26 | 0.55 | -1.251 |
| -1.935221074611437 | 4.238 | 0.566 | -1.241 |
| -1.928937889304257 | 4.216 | 0.581 | -1.23 |
| -1.922654703997078 | 4.194 | 0.597 | -1.218 |
| -1.916371518689898 | 4.173 | 0.611 | -1.207 |
| -1.910088333382718 | 4.151 | 0.626 | -1.195 |
| -1.903805148075539 | 4.129 | 0.64 | -1.183 |
| -1.897521962768359 | 4.108 | 0.654 | -1.17 |
| -1.891238777461179 | 4.087 | 0.668 | -1.157 |
| -1.884955592154 | 4.065 | 0.681 | -1.144 |
| -1.87867240684682 | 4.044 | 0.694 | -1.131 |
| -1.87238922153964 | 4.023 | 0.707 | -1.118 |
| -1.866106036232461 | 4.002 | 0.719 | -1.104 |
| -1.859822850925281 | 3.981 | 0.731 | -1.09 |
| -1.853539665618102 | 3.96 | 0.743 | -1.076 |
| -1.847256480310922 | 3.94 | 0.754 | -1.061 |
| -1.840973295003742 | 3.919 | 0.765 | -1.047 |
| -1.834690109696563 | 3.899 | 0.776 | -1.032 |
| -1.828406924389383 | 3.878 | 0.787 | -1.017 |
| -1.822123739082203 | 3.858 | 0.797 | -1.002 |
| -1.815840553775024 | 3.838 | 0.807 | -0.987 |
| -1.809557368467844 | 3.818 | 0.816 | -0.971 |
| -1.803274183160664 | 3.798 | 0.826 | -0.956 |
| -1.796990997853485 | 3.778 | 0.835 | -0.94 |
| -1.790707812546305 | 3.758 | 0.843 | -0.924 |
| -1.784424627239125 | 3.739 | 0.852 | -0.908 |
| -1.778141441931946 | 3.719 | 0.86 | -0.892 |
| -1.771858256624766 | 3.7 | 0.868 | -0.876 |
| -1.765575071317587 | 3.681 | 0.875 | -0.86 |
| -1.759291886010407 | 3.661 | 0.883 | -0.843 |
| -1.753008700703227 | 3.642 | 0.89 | -0.827 |
| -1.746725515396048 | 3.623 | 0.896 | -0.81 |
| -1.740442330088868 | 3.605 | 0.903 | -0.794 |
| -1.734159144781688 | 3.586 | 0.909 | -0.777 |
| -1.727875959474509 | 3.567 | 0.915 | -0.76 |
| -1.72159277416733 | 3.549 | 0.921 | -0.744 |
| -1.715309588860149 | 3.531 | 0.926 | -0.727 |
| -1.70902640355297 | 3.512 | 0.931 | -0.71 |
| -1.70274321824579 | 3.494 | 0.936 | -0.693 |
| -1.69646003293861 | 3.476 | 0.941 | -0.676 |
| -1.690176847631431 | 3.458 | 0.945 | -0.66 |
| -1.683893662324251 | 3.441 | 0.949 | -0.643 |
| -1.677610477017072 | 3.423 | 0.953 | -0.626 |
| -1.671327291709892 | 3.405 | 0.957 | -0.609 |
| -1.665044106402712 | 3.388 | 0.96 | -0.592 |
| -1.658760921095533 | 3.371 | 0.963 | -0.576 |
| -1.652477735788353 | 3.354 | 0.966 | -0.559 |
| -1.646194550481173 | 3.337 | 0.969 | -0.542 |
| -1.639911365173994 | 3.32 | 0.971 | -0.526 |
| -1.633628179866814 | 3.303 | 0.973 | -0.509 |
| -1.627344994559634 | 3.286 | 0.975 | -0.493 |
| -1.621061809252455 | 3.27 | 0.977 | -0.477 |
| -1.614778623945275 | 3.253 | 0.979 | -0.46 |
| -1.608495438638096 | 3.237 | 0.98 | -0.444 |
| -1.602212253330916 | 3.221 | 0.981 | -0.428 |
| -1.595929068023736 | 3.205 | 0.982 | -0.412 |
| -1.589645882716557 | 3.189 | 0.983 | -0.396 |
| -1.583362697409377 | 3.173 | 0.983 | -0.38 |
| -1.577079512102197 | 3.157 | 0.984 | -0.365 |
| -1.570796326795018 | 3.142 | 0.984 | -0.349 |
| -1.564513141487838 | 3.126 | 0.984 | -0.334 |
| -1.558229956180659 | 3.111 | 0.983 | -0.318 |
| -1.551946770873479 | 3.096 | 0.983 | -0.303 |
| -1.545663585566299 | 3.081 | 0.982 | -0.288 |
| -1.53938040025912 | 3.066 | 0.981 | -0.273 |
| -1.53309721495194 | 3.051 | 0.98 | -0.258 |
| -1.52681402964476 | 3.036 | 0.979 | -0.244 |
| -1.520530844337581 | 3.022 | 0.978 | -0.229 |
| -1.514247659030401 | 3.007 | 0.976 | -0.215 |
| -1.507964473723221 | 2.993 | 0.974 | -0.201 |
| -1.501681288416042 | 2.979 | 0.973 | -0.187 |
| -1.495398103108862 | 2.965 | 0.971 | -0.173 |
| -1.489114917801682 | 2.951 | 0.968 | -0.16 |
| -1.482831732494503 | 2.937 | 0.966 | -0.146 |
| -1.476548547187323 | 2.923 | 0.964 | -0.133 |
| -1.470265361880144 | 2.909 | 0.961 | -0.12 |
| -1.463982176572964 | 2.896 | 0.958 | -0.107 |
| -1.457698991265784 | 2.883 | 0.955 | -0.094 |
| -1.451415805958605 | 2.869 | 0.952 | -0.082 |
| -1.445132620651425 | 2.856 | 0.949 | -0.07 |
| -1.438849435344245 | 2.843 | 0.946 | -0.057 |
| -1.432566250037066 | 2.831 | 0.942 | -0.046 |
| -1.426283064729886 | 2.818 | 0.939 | -0.034 |
| -1.419999879422706 | 2.805 | 0.935 | -0.022 |
| -1.413716694115527 | 2.793 | 0.931 | -0.011 |
| -1.407433508808347 | 2.781 | 0.927 | 0 |
| -1.401150323501168 | 2.768 | 0.923 | 0.011 |
| -1.394867138193988 | 2.756 | 0.919 | 0.022 |
| -1.388583952886808 | 2.744 | 0.915 | 0.032 |
| -1.382300767579629 | 2.732 | 0.91 | 0.042 |
| -1.376017582272449 | 2.721 | 0.906 | 0.052 |
| -1.369734396965269 | 2.709 | 0.901 | 0.062 |
| -1.36345121165809 | 2.698 | 0.897 | 0.072 |
| -1.35716802635091 | 2.686 | 0.892 | 0.081 |
| -1.35088484104373 | 2.675 | 0.887 | 0.09 |
| -1.344601655736551 | 2.664 | 0.882 | 0.099 |
| -1.338318470429371 | 2.653 | 0.877 | 0.108 |
| -1.332035285122191 | 2.642 | 0.872 | 0.116 |
| -1.325752099815012 | 2.631 | 0.867 | 0.125 |
| -1.319468914507832 | 2.62 | 0.862 | 0.133 |
| -1.313185729200653 | 2.61 | 0.856 | 0.141 |
| -1.306902543893473 | 2.599 | 0.851 | 0.148 |
| -1.300619358586293 | 2.589 | 0.845 | 0.156 |
| -1.294336173279114 | 2.579 | 0.84 | 0.163 |
| -1.288052987971934 | 2.569 | 0.834 | 0.17 |
| -1.281769802664754 | 2.559 | 0.829 | 0.177 |
| -1.275486617357575 | 2.549 | 0.823 | 0.183 |
| -1.269203432050395 | 2.539 | 0.817 | 0.19 |
| -1.262920246743215 | 2.53 | 0.812 | 0.196 |
| -1.256637061436036 | 2.52 | 0.806 | 0.202 |
| -1.250353876128856 | 2.511 | 0.8 | 0.208 |
| -1.244070690821677 | 2.502 | 0.794 | 0.213 |
| -1.237787505514497 | 2.493 | 0.788 | 0.218 |
| -1.231504320207317 | 2.483 | 0.782 | 0.223 |
| -1.225221134900138 | 2.475 | 0.776 | 0.228 |
| -1.218937949592958 | 2.466 | 0.77 | 0.233 |
| -1.212654764285778 | 2.457 | 0.764 | 0.238 |
| -1.206371578978599 | 2.448 | 0.758 | 0.242 |
| -1.20008839367142 | 2.44 | 0.752 | 0.246 |
| -1.193805208364239 | 2.432 | 0.746 | 0.25 |
| -1.18752202305706 | 2.423 | 0.74 | 0.254 |
| -1.18123883774988 | 2.415 | 0.734 | 0.257 |
| -1.1749556524427 | 2.407 | 0.727 | 0.26 |
| -1.168672467135521 | 2.399 | 0.721 | 0.264 |
| -1.162389281828341 | 2.391 | 0.715 | 0.267 |
| -1.156106096521162 | 2.384 | 0.709 | 0.269 |
| -1.149822911213982 | 2.376 | 0.703 | 0.272 |
| -1.143539725906802 | 2.368 | 0.696 | 0.274 |
| -1.137256540599623 | 2.361 | 0.69 | 0.277 |
| -1.130973355292443 | 2.354 | 0.684 | 0.279 |
| -1.124690169985263 | 2.346 | 0.678 | 0.281 |
| -1.118406984678084 | 2.339 | 0.672 | 0.282 |
| -1.112123799370904 | 2.332 | 0.665 | 0.284 |
| -1.105840614063724 | 2.325 | 0.659 | 0.285 |
| -1.099557428756545 | 2.319 | 0.653 | 0.287 |
| -1.093274243449365 | 2.312 | 0.647 | 0.288 |
| -1.086991058142186 | 2.305 | 0.641 | 0.289 |
| -1.080707872835006 | 2.299 | 0.635 | 0.29 |
| -1.074424687527826 | 2.292 | 0.629 | 0.29 |
| -1.068141502220647 | 2.286 | 0.623 | 0.291 |
| -1.061858316913467 | 2.28 | 0.617 | 0.291 |
| -1.055575131606287 | 2.274 | 0.611 | 0.291 |
| -1.049291946299108 | 2.267 | 0.605 | 0.291 |
| -1.043008760991928 | 2.262 | 0.599 | 0.291 |
| -1.036725575684748 | 2.256 | 0.593 | 0.291 |
| -1.030442390377569 | 2.25 | 0.587 | 0.291 |
| -1.024159205070389 | 2.244 | 0.581 | 0.291 |
| -1.01787601976321 | 2.239 | 0.575 | 0.29 |
| -1.01159283445603 | 2.233 | 0.569 | 0.289 |
| -1.00530964914885 | 2.228 | 0.564 | 0.289 |
| -0.999026463841671 | 2.222 | 0.558 | 0.288 |
| -0.992743278534491 | 2.217 | 0.552 | 0.287 |
| -0.986460093227311 | 2.212 | 0.546 | 0.286 |
| -0.980176907920132 | 2.207 | 0.541 | 0.285 |
| -0.973893722612952 | 2.202 | 0.535 | 0.283 |
| -0.967610537305772 | 2.197 | 0.53 | 0.282 |
| -0.961327351998593 | 2.192 | 0.524 | 0.281 |
| -0.955044166691413 | 2.188 | 0.519 | 0.279 |
| -0.948760981384233 | 2.183 | 0.513 | 0.278 |
| -0.942477796077054 | 2.178 | 0.508 | 0.276 |
| -0.936194610769874 | 2.174 | 0.503 | 0.274 |
| -0.929911425462695 | 2.17 | 0.498 | 0.272 |
| -0.923628240155515 | 2.165 | 0.492 | 0.27 |
| -0.917345054848335 | 2.161 | 0.487 | 0.268 |
| -0.911061869541156 | 2.157 | 0.482 | 0.266 |
| -0.904778684233976 | 2.153 | 0.477 | 0.264 |
| -0.898495498926796 | 2.149 | 0.472 | 0.262 |
| -0.892212313619617 | 2.145 | 0.467 | 0.26 |
| -0.885929128312437 | 2.141 | 0.462 | 0.258 |
| -0.879645943005257 | 2.137 | 0.458 | 0.255 |
| -0.873362757698078 | 2.133 | 0.453 | 0.253 |
| -0.867079572390898 | 2.13 | 0.448 | 0.251 |
| -0.860796387083718 | 2.126 | 0.444 | 0.248 |
| -0.854513201776539 | 2.123 | 0.439 | 0.246 |
| -0.848230016469359 | 2.119 | 0.435 | 0.243 |
| -0.84194683116218 | 2.116 | 0.43 | 0.24 |
| -0.835663645855 | 2.113 | 0.426 | 0.238 |
| -0.82938046054782 | 2.109 | 0.421 | 0.235 |
| -0.823097275240641 | 2.106 | 0.417 | 0.233 |
| -0.816814089933461 | 2.103 | 0.413 | 0.23 |
| -0.810530904626281 | 2.1 | 0.409 | 0.227 |
| -0.804247719319102 | 2.097 | 0.405 | 0.225 |
| -0.797964534011922 | 2.094 | 0.401 | 0.222 |
| -0.791681348704742 | 2.092 | 0.397 | 0.219 |
| -0.785398163397563 | 2.089 | 0.393 | 0.216 |
| -0.779114978090383 | 2.086 | 0.389 | 0.214 |
| -0.772831792783204 | 2.083 | 0.385 | 0.211 |
| -0.766548607476024 | 2.081 | 0.381 | 0.208 |
| -0.760265422168844 | 2.078 | 0.378 | 0.205 |
| -0.753982236861665 | 2.076 | 0.374 | 0.203 |
| -0.747699051554485 | 2.073 | 0.371 | 0.2 |
| -0.741415866247305 | 2.071 | 0.367 | 0.197 |
| -0.735132680940126 | 2.069 | 0.364 | 0.194 |
| -0.728849495632946 | 2.066 | 0.36 | 0.192 |
| -0.722566310325766 | 2.064 | 0.357 | 0.189 |
| -0.716283125018587 | 2.062 | 0.354 | 0.186 |
| -0.709999939711407 | 2.06 | 0.351 | 0.184 |
| -0.703716754404227 | 2.058 | 0.348 | 0.181 |
| -0.697433569097048 | 2.056 | 0.345 | 0.178 |
| -0.691150383789868 | 2.054 | 0.342 | 0.176 |
| -0.684867198482689 | 2.052 | 0.339 | 0.173 |
| -0.678584013175509 | 2.05 | 0.336 | 0.17 |
| -0.672300827868329 | 2.049 | 0.333 | 0.168 |
| -0.66601764256115 | 2.047 | 0.33 | 0.165 |
| -0.65973445725397 | 2.045 | 0.328 | 0.163 |
| -0.65345127194679 | 2.043 | 0.325 | 0.16 |
| -0.647168086639611 | 2.042 | 0.322 | 0.158 |
| -0.640884901332431 | 2.04 | 0.32 | 0.155 |
| -0.634601716025251 | 2.039 | 0.317 | 0.153 |
| -0.628318530718072 | 2.037 | 0.315 | 0.151 |
| -0.622035345410892 | 2.036 | 0.313 | 0.148 |
| -0.615752160103712 | 2.034 | 0.31 | 0.146 |
| -0.609468974796533 | 2.033 | 0.308 | 0.144 |
| -0.603185789489353 | 2.032 | 0.306 | 0.141 |
| -0.596902604182174 | 2.03 | 0.304 | 0.139 |
| -0.590619418874994 | 2.029 | 0.302 | 0.137 |
| -0.584336233567814 | 2.028 | 0.3 | 0.135 |
| -0.578053048260635 | 2.027 | 0.298 | 0.133 |
| -0.571769862953455 | 2.026 | 0.296 | 0.131 |
| -0.565486677646275 | 2.025 | 0.294 | 0.129 |
| -0.559203492339096 | 2.024 | 0.292 | 0.127 |
| -0.552920307031916 | 2.023 | 0.291 | 0.125 |
| -0.546637121724737 | 2.022 | 0.289 | 0.123 |
| -0.540353936417557 | 2.021 | 0.287 | 0.121 |
| -0.534070751110377 | 2.02 | 0.286 | 0.119 |
| -0.527787565803198 | 2.019 | 0.284 | 0.118 |
| -0.521504380496018 | 2.018 | 0.283 | 0.116 |
| -0.515221195188838 | 2.017 | 0.281 | 0.114 |
| -0.508938009881659 | 2.016 | 0.28 | 0.112 |
| -0.502654824574479 | 2.016 | 0.278 | 0.111 |
| -0.496371639267299 | 2.015 | 0.277 | 0.109 |
| -0.49008845396012 | 2.014 | 0.276 | 0.108 |
| -0.48380526865294 | 2.013 | 0.275 | 0.106 |
| -0.477522083345761 | 2.013 | 0.273 | 0.105 |
| -0.471238898038581 | 2.012 | 0.272 | 0.103 |
| -0.464955712731402 | 2.011 | 0.271 | 0.102 |
| -0.458672527424222 | 2.011 | 0.27 | 0.101 |
| -0.452389342117042 | 2.01 | 0.269 | 0.099 |
| -0.446106156809863 | 2.01 | 0.268 | 0.098 |
| -0.439822971502683 | 2.009 | 0.267 | 0.097 |
| -0.433539786195504 | 2.009 | 0.266 | 0.096 |
| -0.427256600888324 | 2.008 | 0.265 | 0.095 |
| -0.420973415581144 | 2.008 | 0.264 | 0.094 |
| -0.414690230273965 | 2.007 | 0.264 | 0.093 |
| -0.408407044966785 | 2.007 | 0.263 | 0.092 |
| -0.402123859659606 | 2.006 | 0.262 | 0.091 |
| -0.395840674352426 | 2.006 | 0.261 | 0.09 |
| -0.389557489045247 | 2.006 | 0.261 | 0.089 |
| -0.383274303738067 | 2.005 | 0.26 | 0.088 |
| -0.376991118430887 | 2.005 | 0.259 | 0.087 |
| -0.370707933123708 | 2.005 | 0.259 | 0.086 |
| -0.364424747816528 | 2.004 | 0.258 | 0.086 |
| -0.358141562509349 | 2.004 | 0.258 | 0.085 |
| -0.351858377202169 | 2.004 | 0.257 | 0.084 |
| -0.345575191894989 | 2.004 | 0.257 | 0.084 |
| -0.33929200658781 | 2.003 | 0.256 | 0.083 |
| -0.33300882128063 | 2.003 | 0.256 | 0.082 |
| -0.326725635973451 | 2.003 | 0.255 | 0.082 |
| -0.320442450666271 | 2.003 | 0.255 | 0.081 |
| -0.314159265359092 | 2.002 | 0.255 | 0.081 |
| -0.307876080051912 | 2.002 | 0.254 | 0.08 |
| -0.301592894744732 | 2.002 | 0.254 | 0.08 |
| -0.295309709437553 | 2.002 | 0.254 | 0.079 |
| -0.289026524130373 | 2.002 | 0.253 | 0.079 |
| -0.282743338823194 | 2.002 | 0.253 | 0.078 |
| -0.276460153516014 | 2.001 | 0.253 | 0.078 |
| -0.270176968208834 | 2.001 | 0.253 | 0.078 |
| -0.263893782901655 | 2.001 | 0.252 | 0.077 |
| -0.257610597594475 | 2.001 | 0.252 | 0.077 |
| -0.251327412287296 | 2.001 | 0.252 | 0.077 |
| -0.245044226980116 | 2.001 | 0.252 | 0.077 |
| -0.238761041672937 | 2.001 | 0.252 | 0.076 |
| -0.232477856365757 | 2.001 | 0.251 | 0.076 |
| -0.226194671058577 | 2.001 | 0.251 | 0.076 |
| -0.219911485751398 | 2.001 | 0.251 | 0.076 |
| -0.213628300444218 | 2.001 | 0.251 | 0.076 |
| -0.207345115137039 | 2 | 0.251 | 0.075 |
| -0.201061929829859 | 2 | 0.251 | 0.075 |
| -0.194778744522679 | 2 | 0.251 | 0.075 |
| -0.1884955592155 | 2 | 0.251 | 0.075 |
| -0.18221237390832 | 2 | 0.251 | 0.075 |
| -0.175929188601141 | 2 | 0.25 | 0.075 |
| -0.169646003293961 | 2 | 0.25 | 0.075 |
| -0.163362817986782 | 2 | 0.25 | 0.075 |
| -0.157079632679602 | 2 | 0.25 | 0.075 |
| -0.150796447372422 | 2 | 0.25 | 0.074 |
| -0.144513262065243 | 2 | 0.25 | 0.074 |
| -0.138230076758063 | 2 | 0.25 | 0.074 |
| -0.131946891450884 | 2 | 0.25 | 0.074 |
| -0.125663706143704 | 2 | 0.25 | 0.074 |
| -0.119380520836524 | 2 | 0.25 | 0.074 |
| -0.113097335529345 | 2 | 0.25 | 0.074 |
| -0.106814150222165 | 2 | 0.25 | 0.074 |
| -0.100530964914986 | 2 | 0.25 | 0.074 |
| -0.0942477796078061 | 2 | 0.25 | 0.074 |
| -0.0879645943006265 | 2 | 0.25 | 0.074 |
| -0.0816814089934469 | 2 | 0.25 | 0.074 |
| -0.0753982236862674 | 2 | 0.25 | 0.074 |
| -0.0691150383790878 | 2 | 0.25 | 0.074 |
| -0.0628318530719082 | 2 | 0.25 | 0.074 |
| -0.0565486677647286 | 2 | 0.25 | 0.074 |
| -0.050265482457549 | 2 | 0.25 | 0.074 |
| -0.0439822971503694 | 2 | 0.25 | 0.074 |
| -0.0376991118431899 | 2 | 0.25 | 0.074 |
| -0.0314159265360103 | 2 | 0.25 | 0.074 |
| -0.0251327412288307 | 2 | 0.25 | 0.074 |
| -0.0188495559216511 | 2 | 0.25 | 0.074 |
| -0.0125663706144715 | 2 | 0.25 | 0.074 |
| -0.00628318530729192 | 2 | 0.25 | 0.074 |
| -1.12338957580782e-13 | 2 | 0.25 | 0.074 |
| 0.00628318530706725 | 2 | 0.25 | 0.074 |
| 0.0125663706142468 | 2 | 0.25 | 0.074 |
| 0.0188495559214264 | 2 | 0.25 | 0.074 |
| 0.025132741228606 | 2 | 0.25 | 0.074 |
| 0.0314159265357856 | 2 | 0.25 | 0.074 |
| 0.0376991118429652 | 2 | 0.25 | 0.074 |
| 0.0439822971501448 | 2 | 0.25 | 0.074 |
| 0.0502654824573243 | 2 | 0.25 | 0.074 |
| 0.0565486677645039 | 2 | 0.25 | 0.074 |
| 0.0628318530716835 | 2 | 0.25 | 0.074 |
| 0.0691150383788631 | 2 | 0.25 | 0.074 |
| 0.0753982236860427 | 2 | 0.25 | 0.074 |
| 0.0816814089932222 | 2 | 0.25 | 0.074 |
| 0.0879645943004018 | 2 | 0.25 | 0.074 |
| 0.0942477796075814 | 2 | 0.25 | 0.074 |
| 0.100530964914761 | 2 | 0.25 | 0.074 |
| 0.106814150221941 | 2 | 0.25 | 0.074 |
| 0.11309733552912 | 2 | 0.25 | 0.074 |
| 0.1193805208363 | 2 | 0.25 | 0.074 |
| 0.125663706143479 | 2 | 0.25 | 0.074 |
| 0.131946891450659 | 2 | 0.25 | 0.074 |
| 0.138230076757839 | 2 | 0.25 | 0.074 |
| 0.144513262065018 | 2 | 0.25 | 0.074 |
| 0.150796447372198 | 2 | 0.25 | 0.074 |
| 0.157079632679377 | 2 | 0.25 | 0.075 |
| 0.163362817986557 | 2 | 0.25 | 0.075 |
| 0.169646003293736 | 2 | 0.25 | 0.075 |
| 0.175929188600916 | 2 | 0.25 | 0.075 |
| 0.182212373908096 | 2 | 0.251 | 0.075 |
| 0.188495559215275 | 2 | 0.251 | 0.075 |
| 0.194778744522455 | 2 | 0.251 | 0.075 |
| 0.201061929829634 | 2 | 0.251 | 0.075 |
| 0.207345115136814 | 2 | 0.251 | 0.075 |
| 0.213628300443994 | 2.001 | 0.251 | 0.076 |
| 0.219911485751173 | 2.001 | 0.251 | 0.076 |
| 0.226194671058353 | 2.001 | 0.251 | 0.076 |
| 0.232477856365532 | 2.001 | 0.251 | 0.076 |
| 0.238761041672712 | 2.001 | 0.252 | 0.076 |
| 0.245044226979891 | 2.001 | 0.252 | 0.077 |
| 0.251327412287071 | 2.001 | 0.252 | 0.077 |
| 0.257610597594251 | 2.001 | 0.252 | 0.077 |
| 0.26389378290143 | 2.001 | 0.252 | 0.077 |
| 0.27017696820861 | 2.001 | 0.253 | 0.078 |
| 0.276460153515789 | 2.001 | 0.253 | 0.078 |
| 0.282743338822969 | 2.002 | 0.253 | 0.078 |
| 0.289026524130149 | 2.002 | 0.253 | 0.079 |
| 0.295309709437328 | 2.002 | 0.254 | 0.079 |
| 0.301592894744508 | 2.002 | 0.254 | 0.08 |
| 0.307876080051687 | 2.002 | 0.254 | 0.08 |
| 0.314159265358867 | 2.002 | 0.255 | 0.081 |
| 0.320442450666046 | 2.003 | 0.255 | 0.081 |
| 0.326725635973226 | 2.003 | 0.255 | 0.082 |
| 0.333008821280406 | 2.003 | 0.256 | 0.082 |
| 0.339292006587585 | 2.003 | 0.256 | 0.083 |
| 0.345575191894765 | 2.004 | 0.257 | 0.084 |
| 0.351858377201944 | 2.004 | 0.257 | 0.084 |
| 0.358141562509124 | 2.004 | 0.258 | 0.085 |
| 0.364424747816304 | 2.004 | 0.258 | 0.086 |
| 0.370707933123483 | 2.005 | 0.259 | 0.086 |
| 0.376991118430663 | 2.005 | 0.259 | 0.087 |
| 0.383274303737842 | 2.005 | 0.26 | 0.088 |
| 0.389557489045022 | 2.006 | 0.261 | 0.089 |
| 0.395840674352201 | 2.006 | 0.261 | 0.09 |
| 0.402123859659381 | 2.006 | 0.262 | 0.091 |
| 0.408407044966561 | 2.007 | 0.263 | 0.092 |
| 0.41469023027374 | 2.007 | 0.264 | 0.093 |
| 0.42097341558092 | 2.008 | 0.264 | 0.094 |
| 0.427256600888099 | 2.008 | 0.265 | 0.095 |
| 0.433539786195279 | 2.009 | 0.266 | 0.096 |
| 0.439822971502459 | 2.009 | 0.267 | 0.097 |
| 0.446106156809638 | 2.01 | 0.268 | 0.098 |
| 0.452389342116818 | 2.01 | 0.269 | 0.099 |
| 0.458672527423997 | 2.011 | 0.27 | 0.101 |
| 0.464955712731177 | 2.011 | 0.271 | 0.102 |
| 0.471238898038356 | 2.012 | 0.272 | 0.103 |
| 0.477522083345536 | 2.013 | 0.273 | 0.105 |
| 0.483805268652716 | 2.013 | 0.275 | 0.106 |
| 0.490088453959895 | 2.014 | 0.276 | 0.108 |
| 0.496371639267075 | 2.015 | 0.277 | 0.109 |
| 0.502654824574254 | 2.016 | 0.278 | 0.111 |
| 0.508938009881434 | 2.016 | 0.28 | 0.112 |
| 0.515221195188614 | 2.017 | 0.281 | 0.114 |
| 0.521504380495793 | 2.018 | 0.283 | 0.116 |
| 0.527787565802973 | 2.019 | 0.284 | 0.118 |
| 0.534070751110153 | 2.02 | 0.286 | 0.119 |
| 0.540353936417332 | 2.021 | 0.287 | 0.121 |
| 0.546637121724512 | 2.022 | 0.289 | 0.123 |
| 0.552920307031692 | 2.023 | 0.291 | 0.125 |
| 0.559203492338871 | 2.024 | 0.292 | 0.127 |
| 0.565486677646051 | 2.025 | 0.294 | 0.129 |
| 0.571769862953231 | 2.026 | 0.296 | 0.131 |
| 0.57805304826041 | 2.027 | 0.298 | 0.133 |
| 0.58433623356759 | 2.028 | 0.3 | 0.135 |
| 0.590619418874769 | 2.029 | 0.302 | 0.137 |
| 0.596902604181949 | 2.03 | 0.304 | 0.139 |
| 0.603185789489129 | 2.032 | 0.306 | 0.141 |
| 0.609468974796308 | 2.033 | 0.308 | 0.144 |
| 0.615752160103488 | 2.034 | 0.31 | 0.146 |
| 0.622035345410668 | 2.036 | 0.313 | 0.148 |
| 0.628318530717847 | 2.037 | 0.315 | 0.151 |
| 0.634601716025027 | 2.039 | 0.317 | 0.153 |
| 0.640884901332206 | 2.04 | 0.32 | 0.155 |
| 0.647168086639386 | 2.042 | 0.322 | 0.158 |
| 0.653451271946566 | 2.043 | 0.325 | 0.16 |
| 0.659734457253745 | 2.045 | 0.328 | 0.163 |
| 0.666017642560925 | 2.047 | 0.33 | 0.165 |
| 0.672300827868105 | 2.049 | 0.333 | 0.168 |
| 0.678584013175284 | 2.05 | 0.336 | 0.17 |
| 0.684867198482464 | 2.052 | 0.339 | 0.173 |
| 0.691150383789644 | 2.054 | 0.342 | 0.176 |
| 0.697433569096823 | 2.056 | 0.345 | 0.178 |
| 0.703716754404003 | 2.058 | 0.348 | 0.181 |
| 0.709999939711183 | 2.06 | 0.351 | 0.184 |
| 0.716283125018362 | 2.062 | 0.354 | 0.186 |
| 0.722566310325542 | 2.064 | 0.357 | 0.189 |
| 0.728849495632721 | 2.066 | 0.36 | 0.192 |
| 0.735132680939901 | 2.069 | 0.364 | 0.194 |
| 0.741415866247081 | 2.071 | 0.367 | 0.197 |
| 0.74769905155426 | 2.073 | 0.371 | 0.2 |
| 0.75398223686144 | 2.076 | 0.374 | 0.203 |
| 0.76026542216862 | 2.078 | 0.378 | 0.205 |
| 0.766548607475799 | 2.081 | 0.381 | 0.208 |
| 0.772831792782979 | 2.083 | 0.385 | 0.211 |
| 0.779114978090159 | 2.086 | 0.389 | 0.214 |
| 0.785398163397338 | 2.089 | 0.393 | 0.216 |
| 0.791681348704518 | 2.092 | 0.397 | 0.219 |
| 0.797964534011697 | 2.094 | 0.401 | 0.222 |
| 0.804247719318877 | 2.097 | 0.405 | 0.225 |
| 0.810530904626057 | 2.1 | 0.409 | 0.227 |
| 0.816814089933236 | 2.103 | 0.413 | 0.23 |
| 0.823097275240416 | 2.106 | 0.417 | 0.233 |
| 0.829380460547596 | 2.109 | 0.421 | 0.235 |
| 0.835663645854775 | 2.113 | 0.426 | 0.238 |
| 0.841946831161955 | 2.116 | 0.43 | 0.24 |
| 0.848230016469135 | 2.119 | 0.435 | 0.243 |
| 0.854513201776314 | 2.123 | 0.439 | 0.246 |
| 0.860796387083494 | 2.126 | 0.444 | 0.248 |
| 0.867079572390674 | 2.13 | 0.448 | 0.251 |
| 0.873362757697853 | 2.133 | 0.453 | 0.253 |
| 0.879645943005033 | 2.137 | 0.458 | 0.255 |
| 0.885929128312212 | 2.141 | 0.462 | 0.258 |
| 0.892212313619392 | 2.145 | 0.467 | 0.26 |
| 0.898495498926572 | 2.149 | 0.472 | 0.262 |
| 0.904778684233751 | 2.153 | 0.477 | 0.264 |
| 0.911061869540931 | 2.157 | 0.482 | 0.266 |
| 0.917345054848111 | 2.161 | 0.487 | 0.268 |
| 0.92362824015529 | 2.165 | 0.492 | 0.27 |
| 0.92991142546247 | 2.17 | 0.498 | 0.272 |
| 0.93619461076965 | 2.174 | 0.503 | 0.274 |
| 0.942477796076829 | 2.178 | 0.508 | 0.276 |
| 0.948760981384009 | 2.183 | 0.513 | 0.278 |
| 0.955044166691188 | 2.188 | 0.519 | 0.279 |
| 0.961327351998368 | 2.192 | 0.524 | 0.281 |
| 0.967610537305548 | 2.197 | 0.53 | 0.282 |
| 0.973893722612727 | 2.202 | 0.535 | 0.283 |
| 0.980176907919907 | 2.207 | 0.541 | 0.285 |
| 0.986460093227087 | 2.212 | 0.546 | 0.286 |
| 0.992743278534266 | 2.217 | 0.552 | 0.287 |
| 0.999026463841446 | 2.222 | 0.558 | 0.288 |
| 1.005309649148626 | 2.228 | 0.564 | 0.289 |
| 1.011592834455805 | 2.233 | 0.569 | 0.289 |
| 1.017876019762985 | 2.239 | 0.575 | 0.29 |
| 1.024159205070164 | 2.244 | 0.581 | 0.291 |
| 1.030442390377344 | 2.25 | 0.587 | 0.291 |
| 1.036725575684524 | 2.256 | 0.593 | 0.291 |
| 1.043008760991703 | 2.262 | 0.599 | 0.291 |
| 1.049291946298883 | 2.267 | 0.605 | 0.291 |
| 1.055575131606063 | 2.274 | 0.611 | 0.291 |
| 1.061858316913242 | 2.28 | 0.617 | 0.291 |
| 1.068141502220422 | 2.286 | 0.623 | 0.291 |
| 1.074424687527602 | 2.292 | 0.629 | 0.29 |
| 1.080707872834781 | 2.299 | 0.635 | 0.29 |
| 1.086991058141961 | 2.305 | 0.641 | 0.289 |
| 1.09327424344914 | 2.312 | 0.647 | 0.288 |
| 1.09955742875632 | 2.319 | 0.653 | 0.287 |
| 1.1058406140635 | 2.325 | 0.659 | 0.285 |
| 1.112123799370679 | 2.332 | 0.665 | 0.284 |
| 1.11840698467786 | 2.339 | 0.672 | 0.282 |
| 1.124690169985039 | 2.346 | 0.678 | 0.281 |
| 1.130973355292218 | 2.354 | 0.684 | 0.279 |
| 1.137256540599398 | 2.361 | 0.69 | 0.277 |
| 1.143539725906578 | 2.368 | 0.696 | 0.274 |
| 1.149822911213757 | 2.376 | 0.703 | 0.272 |
| 1.156106096520937 | 2.384 | 0.709 | 0.269 |
| 1.162389281828116 | 2.391 | 0.715 | 0.267 |
| 1.168672467135296 | 2.399 | 0.721 | 0.264 |
| 1.174955652442476 | 2.407 | 0.727 | 0.26 |
| 1.181238837749655 | 2.415 | 0.734 | 0.257 |
| 1.187522023056835 | 2.423 | 0.74 | 0.254 |
| 1.193805208364015 | 2.432 | 0.746 | 0.25 |
| 1.200088393671194 | 2.44 | 0.752 | 0.246 |
| 1.206371578978374 | 2.448 | 0.758 | 0.242 |
| 1.212654764285554 | 2.457 | 0.764 | 0.238 |
| 1.218937949592733 | 2.466 | 0.77 | 0.233 |
| 1.225221134899913 | 2.475 | 0.776 | 0.228 |
| 1.231504320207093 | 2.483 | 0.782 | 0.223 |
| 1.237787505514272 | 2.493 | 0.788 | 0.218 |
| 1.244070690821452 | 2.502 | 0.794 | 0.213 |
| 1.250353876128631 | 2.511 | 0.8 | 0.208 |
| 1.256637061435811 | 2.52 | 0.806 | 0.202 |
| 1.262920246742991 | 2.53 | 0.812 | 0.196 |
| 1.26920343205017 | 2.539 | 0.817 | 0.19 |
| 1.27548661735735 | 2.549 | 0.823 | 0.183 |
| 1.28176980266453 | 2.559 | 0.829 | 0.177 |
| 1.28805298797171 | 2.569 | 0.834 | 0.17 |
| 1.294336173278889 | 2.579 | 0.84 | 0.163 |
| 1.300619358586069 | 2.589 | 0.845 | 0.156 |
| 1.306902543893248 | 2.599 | 0.851 | 0.148 |
| 1.313185729200428 | 2.61 | 0.856 | 0.141 |
| 1.319468914507607 | 2.62 | 0.862 | 0.133 |
| 1.325752099814787 | 2.631 | 0.867 | 0.125 |
| 1.332035285121967 | 2.642 | 0.872 | 0.116 |
| 1.338318470429146 | 2.653 | 0.877 | 0.108 |
| 1.344601655736326 | 2.664 | 0.882 | 0.099 |
| 1.350884841043506 | 2.675 | 0.887 | 0.09 |
| 1.357168026350685 | 2.686 | 0.892 | 0.081 |
| 1.363451211657865 | 2.698 | 0.897 | 0.072 |
| 1.369734396965045 | 2.709 | 0.901 | 0.062 |
| 1.376017582272224 | 2.721 | 0.906 | 0.052 |
| 1.382300767579404 | 2.732 | 0.91 | 0.042 |
| 1.388583952886583 | 2.744 | 0.915 | 0.032 |
| 1.394867138193763 | 2.756 | 0.919 | 0.022 |
| 1.401150323500943 | 2.768 | 0.923 | 0.011 |
| 1.407433508808122 | 2.781 | 0.927 | 0 |
| 1.413716694115302 | 2.793 | 0.931 | -0.011 |
| 1.419999879422482 | 2.805 | 0.935 | -0.022 |
| 1.426283064729661 | 2.818 | 0.939 | -0.034 |
| 1.432566250036841 | 2.831 | 0.942 | -0.046 |
| 1.438849435344021 | 2.843 | 0.946 | -0.057 |
| 1.4451326206512 | 2.856 | 0.949 | -0.07 |
| 1.45141580595838 | 2.869 | 0.952 | -0.082 |
| 1.45769899126556 | 2.883 | 0.955 | -0.094 |
| 1.46398217657274 | 2.896 | 0.958 | -0.107 |
| 1.470265361879919 | 2.909 | 0.961 | -0.12 |
| 1.476548547187098 | 2.923 | 0.964 | -0.133 |
| 1.482831732494278 | 2.937 | 0.966 | -0.146 |
| 1.489114917801458 | 2.951 | 0.968 | -0.16 |
| 1.495398103108637 | 2.965 | 0.971 | -0.173 |
| 1.501681288415817 | 2.979 | 0.973 | -0.187 |
| 1.507964473722997 | 2.993 | 0.974 | -0.201 |
| 1.514247659030176 | 3.007 | 0.976 | -0.215 |
| 1.520530844337356 | 3.022 | 0.978 | -0.229 |
| 1.526814029644536 | 3.036 | 0.979 | -0.244 |
| 1.533097214951715 | 3.051 | 0.98 | -0.258 |
| 1.539380400258895 | 3.066 | 0.981 | -0.273 |
| 1.545663585566075 | 3.081 | 0.982 | -0.288 |
| 1.551946770873254 | 3.096 | 0.983 | -0.303 |
| 1.558229956180434 | 3.111 | 0.983 | -0.318 |
| 1.564513141487613 | 3.126 | 0.984 | -0.334 |
| 1.570796326794793 | 3.142 | 0.984 | -0.349 |
| 1.577079512101973 | 3.157 | 0.984 | -0.365 |
| 1.583362697409152 | 3.173 | 0.983 | -0.38 |
| 1.589645882716332 | 3.189 | 0.983 | -0.396 |
| 1.595929068023512 | 3.205 | 0.982 | -0.412 |
| 1.602212253330691 | 3.221 | 0.981 | -0.428 |
| 1.608495438637871 | 3.237 | 0.98 | -0.444 |
| 1.61477862394505 | 3.253 | 0.979 | -0.46 |
| 1.62106180925223 | 3.27 | 0.977 | -0.477 |
| 1.62734499455941 | 3.286 | 0.975 | -0.493 |
| 1.633628179866589 | 3.303 | 0.973 | -0.509 |
| 1.63991136517377 | 3.32 | 0.971 | -0.526 |
| 1.646194550480949 | 3.337 | 0.969 | -0.542 |
| 1.652477735788128 | 3.354 | 0.966 | -0.559 |
| 1.658760921095308 | 3.371 | 0.963 | -0.576 |
| 1.665044106402488 | 3.388 | 0.96 | -0.592 |
| 1.671327291709667 | 3.405 | 0.957 | -0.609 |
| 1.677610477016847 | 3.423 | 0.953 | -0.626 |
| 1.683893662324026 | 3.441 | 0.949 | -0.643 |
| 1.690176847631206 | 3.458 | 0.945 | -0.66 |
| 1.696460032938386 | 3.476 | 0.941 | -0.676 |
| 1.702743218245565 | 3.494 | 0.936 | -0.693 |
| 1.709026403552745 | 3.512 | 0.931 | -0.71 |
| 1.715309588859925 | 3.531 | 0.926 | -0.727 |
| 1.721592774167104 | 3.549 | 0.921 | -0.744 |
| 1.727875959474284 | 3.567 | 0.915 | -0.76 |
| 1.734159144781464 | 3.586 | 0.909 | -0.777 |
| 1.740442330088643 | 3.605 | 0.903 | -0.794 |
| 1.746725515395823 | 3.623 | 0.896 | -0.81 |
| 1.753008700703003 | 3.642 | 0.89 | -0.827 |
| 1.759291886010182 | 3.661 | 0.883 | -0.843 |
| 1.765575071317362 | 3.681 | 0.875 | -0.86 |
| 1.771858256624541 | 3.7 | 0.868 | -0.876 |
| 1.778141441931721 | 3.719 | 0.86 | -0.892 |
| 1.784424627238901 | 3.739 | 0.852 | -0.908 |
| 1.79070781254608 | 3.758 | 0.843 | -0.924 |
| 1.79699099785326 | 3.778 | 0.835 | -0.94 |
| 1.80327418316044 | 3.798 | 0.826 | -0.956 |
| 1.809557368467619 | 3.818 | 0.816 | -0.971 |
| 1.815840553774799 | 3.838 | 0.807 | -0.987 |
| 1.822123739081979 | 3.858 | 0.797 | -1.002 |
| 1.828406924389158 | 3.878 | 0.787 | -1.017 |
| 1.834690109696338 | 3.899 | 0.776 | -1.032 |
| 1.840973295003518 | 3.919 | 0.765 | -1.047 |
| 1.847256480310697 | 3.94 | 0.754 | -1.061 |
| 1.853539665617877 | 3.96 | 0.743 | -1.076 |
| 1.859822850925056 | 3.981 | 0.731 | -1.09 |
| 1.866106036232236 | 4.002 | 0.719 | -1.104 |
| 1.872389221539416 | 4.023 | 0.707 | -1.118 |
| 1.878672406846595 | 4.044 | 0.694 | -1.131 |
| 1.884955592153775 | 4.065 | 0.681 | -1.144 |
| 1.891238777460955 | 4.087 | 0.668 | -1.157 |
| 1.897521962768134 | 4.108 | 0.654 | -1.17 |
| 1.903805148075314 | 4.129 | 0.64 | -1.183 |
| 1.910088333382494 | 4.151 | 0.626 | -1.195 |
| 1.916371518689673 | 4.173 | 0.611 | -1.207 |
| 1.922654703996853 | 4.194 | 0.597 | -1.218 |
| 1.928937889304033 | 4.216 | 0.581 | -1.23 |
| 1.935221074611212 | 4.238 | 0.566 | -1.241 |
| 1.941504259918392 | 4.26 | 0.55 | -1.251 |
| 1.947787445225571 | 4.282 | 0.534 | -1.262 |
| 1.954070630532751 | 4.305 | 0.517 | -1.272 |
| 1.960353815839931 | 4.327 | 0.501 | -1.281 |
| 1.96663700114711 | 4.349 | 0.483 | -1.29 |
| 1.97292018645429 | 4.372 | 0.466 | -1.299 |
| 1.97920337176147 | 4.394 | 0.448 | -1.308 |
| 1.985486557068649 | 4.417 | 0.43 | -1.316 |
| 1.991769742375829 | 4.44 | 0.412 | -1.324 |
| 1.998052927683009 | 4.462 | 0.393 | -1.331 |
| 2.004336112990188 | 4.485 | 0.374 | -1.338 |
| 2.010619298297368 | 4.508 | 0.354 | -1.345 |
| 2.016902483604547 | 4.531 | 0.335 | -1.351 |
| 2.023185668911727 | 4.554 | 0.315 | -1.356 |
| 2.029468854218907 | 4.578 | 0.294 | -1.362 |
| 2.035752039526086 | 4.601 | 0.274 | -1.366 |
| 2.042035224833266 | 4.624 | 0.253 | -1.371 |
| 2.048318410140446 | 4.647 | 0.231 | -1.375 |
| 2.054601595447625 | 4.671 | 0.209 | -1.378 |
| 2.060884780754805 | 4.694 | 0.187 | -1.381 |
| 2.067167966061984 | 4.718 | 0.165 | -1.383 |
| 2.073451151369164 | 4.742 | 0.143 | -1.385 |
| 2.079734336676344 | 4.765 | 0.12 | -1.387 |
| 2.086017521983524 | 4.789 | 0.096 | -1.388 |
| 2.092300707290703 | 4.813 | 0.073 | -1.388 |
| 2.098583892597883 | 4.837 | 0.049 | -1.388 |
| 2.104867077905062 | 4.861 | 0.025 | -1.387 |
| 2.111150263212242 | 4.885 | 0 | -1.386 |
| 2.117433448519422 | 4.909 | -0.025 | -1.385 |
| 2.123716633826601 | 4.933 | -0.05 | -1.382 |
| 2.129999819133781 | 4.957 | -0.076 | -1.38 |
| 2.136283004440961 | 4.981 | -0.101 | -1.376 |
| 2.14256618974814 | 5.005 | -0.127 | -1.372 |
| 2.14884937505532 | 5.03 | -0.154 | -1.368 |
| 2.1551325603625 | 5.054 | -0.181 | -1.363 |
| 2.16141574566968 | 5.078 | -0.208 | -1.357 |
| 2.167698930976859 | 5.103 | -0.235 | -1.351 |
| 2.173982116284038 | 5.127 | -0.262 | -1.344 |
| 2.180265301591218 | 5.152 | -0.29 | -1.337 |
| 2.186548486898398 | 5.176 | -0.319 | -1.329 |
| 2.192831672205577 | 5.201 | -0.347 | -1.321 |
| 2.199114857512757 | 5.225 | -0.376 | -1.312 |
| 2.205398042819936 | 5.25 | -0.405 | -1.302 |
| 2.211681228127116 | 5.274 | -0.434 | -1.292 |
| 2.217964413434296 | 5.299 | -0.464 | -1.281 |
| 2.224247598741475 | 5.324 | -0.494 | -1.269 |
| 2.230530784048655 | 5.348 | -0.524 | -1.257 |
| 2.236813969355835 | 5.373 | -0.554 | -1.244 |
| 2.243097154663014 | 5.398 | -0.585 | -1.231 |
| 2.249380339970194 | 5.423 | -0.616 | -1.217 |
| 2.255663525277374 | 5.447 | -0.647 | -1.203 |
| 2.261946710584553 | 5.472 | -0.678 | -1.187 |
| 2.268229895891733 | 5.497 | -0.71 | -1.172 |
| 2.274513081198912 | 5.522 | -0.742 | -1.155 |
| 2.280796266506092 | 5.547 | -0.774 | -1.138 |
| 2.287079451813272 | 5.571 | -0.807 | -1.121 |
| 2.293362637120452 | 5.596 | -0.839 | -1.102 |
| 2.299645822427631 | 5.621 | -0.872 | -1.083 |
| 2.305929007734811 | 5.646 | -0.905 | -1.064 |
| 2.312212193041991 | 5.67 | -0.939 | -1.044 |
| 2.31849537834917 | 5.695 | -0.972 | -1.023 |
| 2.32477856365635 | 5.72 | -1.006 | -1.002 |
| 2.331061748963529 | 5.745 | -1.04 | -0.98 |
| 2.337344934270709 | 5.769 | -1.074 | -0.957 |
| 2.343628119577889 | 5.794 | -1.109 | -0.934 |
| 2.349911304885068 | 5.819 | -1.143 | -0.91 |
| 2.356194490192248 | 5.844 | -1.178 | -0.886 |
| 2.362477675499428 | 5.868 | -1.213 | -0.861 |
| 2.368760860806607 | 5.893 | -1.248 | -0.835 |
| 2.375044046113787 | 5.917 | -1.284 | -0.809 |
| 2.381327231420966 | 5.942 | -1.319 | -0.783 |
| 2.387610416728146 | 5.967 | -1.355 | -0.755 |
| 2.393893602035326 | 5.991 | -1.391 | -0.727 |
| 2.400176787342505 | 6.016 | -1.427 | -0.699 |
| 2.406459972649685 | 6.04 | -1.463 | -0.67 |
| 2.412743157956865 | 6.064 | -1.499 | -0.64 |
| 2.419026343264044 | 6.089 | -1.535 | -0.61 |
| 2.425309528571224 | 6.113 | -1.572 | -0.579 |
| 2.431592713878404 | 6.137 | -1.609 | -0.548 |
| 2.437875899185583 | 6.161 | -1.645 | -0.516 |
| 2.444159084492763 | 6.186 | -1.682 | -0.484 |
| 2.450442269799943 | 6.21 | -1.719 | -0.451 |
| 2.456725455107122 | 6.234 | -1.756 | -0.418 |
| 2.463008640414302 | 6.258 | -1.794 | -0.384 |
| 2.469291825721482 | 6.281 | -1.831 | -0.35 |
| 2.475575011028661 | 6.305 | -1.868 | -0.315 |
| 2.481858196335841 | 6.329 | -1.906 | -0.28 |
| 2.48814138164302 | 6.353 | -1.943 | -0.244 |
| 2.4944245669502 | 6.376 | -1.981 | -0.208 |
| 2.50070775225738 | 6.4 | -2.018 | -0.171 |
| 2.506990937564559 | 6.423 | -2.056 | -0.134 |
| 2.51327412287174 | 6.447 | -2.094 | -0.097 |
| 2.519557308178919 | 6.47 | -2.132 | -0.059 |
| 2.525840493486098 | 6.493 | -2.169 | -0.02 |
| 2.532123678793278 | 6.516 | -2.207 | 0.018 |
| 2.538406864100458 | 6.539 | -2.245 | 0.058 |
| 2.544690049407637 | 6.562 | -2.283 | 0.097 |
| 2.550973234714817 | 6.585 | -2.321 | 0.137 |
| 2.557256420021996 | 6.608 | -2.358 | 0.177 |
| 2.563539605329176 | 6.63 | -2.396 | 0.218 |
| 2.569822790636356 | 6.653 | -2.434 | 0.259 |
| 2.576105975943535 | 6.675 | -2.472 | 0.3 |
| 2.582389161250715 | 6.698 | -2.51 | 0.342 |
| 2.588672346557895 | 6.72 | -2.547 | 0.383 |
| 2.594955531865074 | 6.742 | -2.585 | 0.425 |
| 2.601238717172254 | 6.764 | -2.622 | 0.468 |
| 2.607521902479433 | 6.786 | -2.66 | 0.51 |
| 2.613805087786613 | 6.807 | -2.697 | 0.553 |
| 2.620088273093793 | 6.829 | -2.735 | 0.596 |
| 2.626371458400972 | 6.85 | -2.772 | 0.639 |
| 2.632654643708152 | 6.871 | -2.809 | 0.683 |
| 2.638937829015332 | 6.893 | -2.846 | 0.726 |
| 2.645221014322511 | 6.914 | -2.883 | 0.77 |
| 2.651504199629691 | 6.934 | -2.919 | 0.814 |
| 2.657787384936871 | 6.955 | -2.956 | 0.858 |
| 2.66407057024405 | 6.976 | -2.993 | 0.902 |
| 2.67035375555123 | 6.996 | -3.029 | 0.946 |
| 2.67663694085841 | 7.016 | -3.065 | 0.991 |
| 2.682920126165589 | 7.037 | -3.101 | 1.035 |
| 2.689203311472769 | 7.057 | -3.137 | 1.079 |
| 2.695486496779948 | 7.076 | -3.173 | 1.124 |
| 2.701769682087128 | 7.096 | -3.208 | 1.168 |
| 2.708052867394308 | 7.115 | -3.243 | 1.213 |
| 2.714336052701487 | 7.135 | -3.278 | 1.257 |
| 2.720619238008667 | 7.154 | -3.313 | 1.301 |
| 2.726902423315847 | 7.173 | -3.348 | 1.346 |
| 2.733185608623026 | 7.191 | -3.382 | 1.39 |
| 2.739468793930206 | 7.21 | -3.416 | 1.434 |
| 2.745751979237386 | 7.228 | -3.45 | 1.478 |
| 2.752035164544565 | 7.246 | -3.483 | 1.522 |
| 2.758318349851745 | 7.264 | -3.517 | 1.566 |
| 2.764601535158925 | 7.282 | -3.55 | 1.609 |
| 2.770884720466104 | 7.3 | -3.582 | 1.652 |
| 2.777167905773284 | 7.317 | -3.615 | 1.696 |
| 2.783451091080463 | 7.334 | -3.647 | 1.739 |
| 2.789734276387643 | 7.351 | -3.679 | 1.781 |
| 2.796017461694823 | 7.368 | -3.71 | 1.824 |
| 2.802300647002002 | 7.385 | -3.741 | 1.866 |
| 2.808583832309182 | 7.401 | -3.772 | 1.908 |
| 2.814867017616362 | 7.417 | -3.803 | 1.949 |
| 2.821150202923541 | 7.433 | -3.833 | 1.99 |
| 2.827433388230721 | 7.448 | -3.863 | 2.031 |
| 2.833716573537901 | 7.464 | -3.892 | 2.072 |
| 2.83999975884508 | 7.479 | -3.921 | 2.112 |
| 2.84628294415226 | 7.494 | -3.949 | 2.151 |
| 2.852566129459439 | 7.509 | -3.977 | 2.19 |
| 2.858849314766619 | 7.523 | -4.005 | 2.229 |
| 2.865132500073799 | 7.537 | -4.032 | 2.267 |
| 2.871415685380978 | 7.551 | -4.059 | 2.305 |
| 2.877698870688158 | 7.565 | -4.086 | 2.343 |
| 2.883982055995337 | 7.578 | -4.112 | 2.379 |
| 2.890265241302517 | 7.592 | -4.137 | 2.416 |
| 2.896548426609697 | 7.605 | -4.162 | 2.451 |
| 2.902831611916877 | 7.617 | -4.187 | 2.486 |
| 2.909114797224056 | 7.63 | -4.211 | 2.521 |
| 2.915397982531236 | 7.642 | -4.235 | 2.555 |
| 2.921681167838416 | 7.653 | -4.258 | 2.588 |
| 2.927964353145595 | 7.665 | -4.28 | 2.62 |
| 2.934247538452775 | 7.676 | -4.302 | 2.652 |
| 2.940530723759954 | 7.687 | -4.324 | 2.683 |
| 2.946813909067134 | 7.698 | -4.345 | 2.714 |
| 2.953097094374314 | 7.708 | -4.365 | 2.743 |
| 2.959380279681493 | 7.719 | -4.385 | 2.772 |
| 2.965663464988673 | 7.728 | -4.405 | 2.801 |
| 2.971946650295853 | 7.738 | -4.423 | 2.828 |
| 2.978229835603032 | 7.747 | -4.441 | 2.855 |
| 2.984513020910212 | 7.756 | -4.459 | 2.881 |
| 2.990796206217391 | 7.765 | -4.476 | 2.906 |
| 2.997079391524571 | 7.773 | -4.492 | 2.93 |
| 3.003362576831751 | 7.781 | -4.508 | 2.953 |
| 3.009645762138931 | 7.789 | -4.523 | 2.975 |
| 3.01592894744611 | 7.796 | -4.538 | 2.997 |
| 3.02221213275329 | 7.803 | -4.552 | 3.017 |
| 3.028495318060469 | 7.81 | -4.565 | 3.037 |
| 3.034778503367649 | 7.816 | -4.578 | 3.056 |
| 3.041061688674829 | 7.822 | -4.59 | 3.074 |
| 3.047344873982008 | 7.828 | -4.601 | 3.09 |
| 3.053628059289188 | 7.833 | -4.611 | 3.106 |
| 3.059911244596367 | 7.838 | -4.621 | 3.121 |
| 3.066194429903547 | 7.842 | -4.631 | 3.135 |
| 3.072477615210727 | 7.847 | -4.639 | 3.147 |
| 3.078760800517906 | 7.851 | -4.647 | 3.159 |
| 3.085043985825086 | 7.854 | -4.654 | 3.17 |
| 3.091327171132266 | 7.857 | -4.66 | 3.179 |
| 3.097610356439445 | 7.86 | -4.666 | 3.188 |
| 3.103893541746625 | 7.863 | -4.671 | 3.195 |
| 3.110176727053805 | 7.865 | -4.675 | 3.201 |
| 3.116459912360984 | 7.867 | -4.679 | 3.207 |
| 3.122743097668164 | 7.868 | -4.681 | 3.211 |
| 3.129026282975343 | 7.869 | -4.683 | 3.213 |
| 3.135309468282523 | 7.869 | -4.684 | 3.215 |
| 3.141592653589703 | 7.87 | -4.685 | 3.216 |
| 3.147875838896883 | 7.869 | -4.684 | 3.215 |
| 3.154159024204062 | 7.869 | -4.683 | 3.213 |
| 3.160442209511242 | 7.868 | -4.681 | 3.21 |
| 3.166725394818422 | 7.866 | -4.679 | 3.206 |
| 3.173008580125601 | 7.865 | -4.675 | 3.201 |
| 3.179291765432781 | 7.862 | -4.671 | 3.194 |
| 3.18557495073996 | 7.86 | -4.665 | 3.187 |
| 3.19185813604714 | 7.857 | -4.659 | 3.178 |
| 3.19814132135432 | 7.853 | -4.653 | 3.167 |
| 3.2044245066615 | 7.85 | -4.645 | 3.156 |
| 3.210707691968679 | 7.845 | -4.636 | 3.143 |
| 3.216990877275859 | 7.841 | -4.627 | 3.129 |
| 3.223274062583038 | 7.836 | -4.617 | 3.114 |
| 3.229557247890217 | 7.83 | -4.606 | 3.098 |
| 3.235840433197398 | 7.824 | -4.594 | 3.08 |
| 3.242123618504577 | 7.818 | -4.581 | 3.061 |
| 3.248406803811757 | 7.811 | -4.567 | 3.041 |
| 3.254689989118936 | 7.803 | -4.553 | 3.019 |
| 3.260973174426116 | 7.796 | -4.538 | 2.996 |
| 3.267256359733296 | 7.788 | -4.521 | 2.972 |
| 3.273539545040475 | 7.779 | -4.504 | 2.947 |
| 3.279822730347655 | 7.77 | -4.486 | 2.92 |
| 3.286105915654835 | 7.76 | -4.467 | 2.893 |
| 3.292389100962014 | 7.75 | -4.448 | 2.863 |
| 3.298672286269194 | 7.74 | -4.427 | 2.833 |
| 3.304955471576374 | 7.729 | -4.405 | 2.801 |
| 3.311238656883553 | 7.718 | -4.383 | 2.768 |
| 3.317521842190732 | 7.706 | -4.359 | 2.734 |
| 3.323805027497912 | 7.693 | -4.335 | 2.699 |
| 3.330088212805092 | 7.68 | -4.31 | 2.662 |
| 3.336371398112272 | 7.667 | -4.284 | 2.624 |
| 3.342654583419451 | 7.653 | -4.257 | 2.585 |
| 3.34893776872663 | 7.639 | -4.229 | 2.544 |
| 3.355220954033811 | 7.624 | -4.2 | 2.503 |
| 3.36150413934099 | 7.609 | -4.17 | 2.46 |
| 3.36778732464817 | 7.593 | -4.14 | 2.416 |
| 3.37407050995535 | 7.577 | -4.108 | 2.37 |
| 3.380353695262529 | 7.56 | -4.075 | 2.324 |
| 3.386636880569709 | 7.543 | -4.042 | 2.276 |
| 3.392920065876888 | 7.526 | -4.008 | 2.227 |
| 3.399203251184068 | 7.507 | -3.972 | 2.177 |
| 3.405486436491248 | 7.489 | -3.936 | 2.126 |
| 3.411769621798427 | 7.469 | -3.899 | 2.073 |
| 3.418052807105607 | 7.449 | -3.861 | 2.02 |
| 3.424335992412787 | 7.429 | -3.822 | 1.965 |
| 3.430619177719966 | 7.408 | -3.782 | 1.909 |
| 3.436902363027146 | 7.387 | -3.741 | 1.852 |
| 3.443185548334325 | 7.365 | -3.699 | 1.794 |
| 3.449468733641505 | 7.343 | -3.656 | 1.735 |
| 3.455751918948685 | 7.32 | -3.613 | 1.675 |
| 3.462035104255865 | 7.296 | -3.568 | 1.614 |
| 3.468318289563044 | 7.272 | -3.523 | 1.552 |
| 3.474601474870224 | 7.248 | -3.476 | 1.488 |
| 3.480884660177403 | 7.223 | -3.429 | 1.424 |
| 3.487167845484583 | 7.197 | -3.381 | 1.359 |
| 3.493451030791763 | 7.171 | -3.332 | 1.292 |
| 3.499734216098942 | 7.144 | -3.282 | 1.225 |
| 3.506017401406122 | 7.117 | -3.231 | 1.157 |
| 3.512300586713302 | 7.089 | -3.179 | 1.088 |
| 3.518583772020481 | 7.061 | -3.126 | 1.018 |
| 3.524866957327661 | 7.032 | -3.072 | 0.947 |
| 3.531150142634841 | 7.003 | -3.018 | 0.876 |
| 3.53743332794202 | 6.973 | -2.962 | 0.803 |
| 3.5437165132492 | 6.942 | -2.906 | 0.73 |
| 3.54999969855638 | 6.911 | -2.848 | 0.656 |
| 3.556282883863559 | 6.879 | -2.79 | 0.581 |
| 3.562566069170739 | 6.847 | -2.731 | 0.505 |
| 3.568849254477918 | 6.814 | -2.671 | 0.429 |
| 3.575132439785098 | 6.78 | -2.611 | 0.352 |
| 3.581415625092278 | 6.746 | -2.549 | 0.274 |
| 3.587698810399457 | 6.712 | -2.486 | 0.196 |
| 3.593981995706637 | 6.677 | -2.423 | 0.117 |
| 3.600265181013817 | 6.641 | -2.359 | 0.037 |
| 3.606548366320996 | 6.604 | -2.294 | -0.043 |
| 3.612831551628176 | 6.568 | -2.228 | -0.124 |
| 3.619114736935355 | 6.53 | -2.161 | -0.205 |
| 3.625397922242535 | 6.492 | -2.093 | -0.287 |
| 3.631681107549715 | 6.453 | -2.025 | -0.369 |
| 3.637964292856894 | 6.414 | -1.956 | -0.452 |
| 3.644247478164074 | 6.374 | -1.886 | -0.535 |
| 3.650530663471254 | 6.333 | -1.815 | -0.618 |
| 3.656813848778433 | 6.292 | -1.743 | -0.702 |
| 3.663097034085613 | 6.251 | -1.671 | -0.786 |
| 3.669380219392792 | 6.208 | -1.597 | -0.871 |
| 3.675663404699972 | 6.165 | -1.523 | -0.956 |
| 3.681946590007152 | 6.122 | -1.449 | -1.041 |
| 3.688229775314331 | 6.078 | -1.373 | -1.126 |
| 3.694512960621511 | 6.033 | -1.297 | -1.211 |
| 3.700796145928691 | 5.988 | -1.22 | -1.297 |
| 3.70707933123587 | 5.942 | -1.142 | -1.382 |
| 3.71336251654305 | 5.895 | -1.064 | -1.468 |
| 3.71964570185023 | 5.848 | -0.984 | -1.554 |
| 3.72592888715741 | 5.8 | -0.904 | -1.639 |
| 3.732212072464589 | 5.752 | -0.824 | -1.725 |
| 3.738495257771769 | 5.703 | -0.743 | -1.811 |
| 3.744778443078948 | 5.653 | -0.661 | -1.897 |
| 3.751061628386128 | 5.603 | -0.578 | -1.982 |
| 3.757344813693308 | 5.552 | -0.495 | -2.068 |
| 3.763627999000487 | 5.5 | -0.411 | -2.153 |
| 3.769911184307667 | 5.448 | -0.326 | -2.238 |
| 3.776194369614846 | 5.395 | -0.241 | -2.323 |
| 3.782477554922026 | 5.342 | -0.155 | -2.407 |
| 3.788760740229206 | 5.288 | -0.068 | -2.491 |
| 3.795043925536385 | 5.233 | 0.019 | -2.575 |
| 3.801327110843565 | 5.178 | 0.106 | -2.659 |
| 3.807610296150745 | 5.122 | 0.195 | -2.742 |
| 3.813893481457924 | 5.065 | 0.283 | -2.825 |
| 3.820176666765104 | 5.008 | 0.373 | -2.907 |
| 3.826459852072284 | 4.95 | 0.463 | -2.988 |
| 3.832743037379463 | 4.892 | 0.553 | -3.07 |
| 3.839026222686643 | 4.832 | 0.644 | -3.15 |
| 3.845309407993823 | 4.773 | 0.735 | -3.23 |
| 3.851592593301002 | 4.712 | 0.827 | -3.31 |
| 3.857875778608182 | 4.651 | 0.92 | -3.388 |
| 3.864158963915361 | 4.589 | 1.012 | -3.466 |
| 3.870442149222541 | 4.527 | 1.106 | -3.543 |
| 3.876725334529721 | 4.464 | 1.199 | -3.62 |
| 3.8830085198369 | 4.4 | 1.294 | -3.696 |
| 3.88929170514408 | 4.336 | 1.388 | -3.77 |
| 3.89557489045126 | 4.271 | 1.483 | -3.844 |
| 3.901858075758439 | 4.206 | 1.579 | -3.917 |
| 3.908141261065619 | 4.139 | 1.674 | -3.989 |
| 3.914424446372799 | 4.072 | 1.77 | -4.06 |
| 3.920707631679978 | 4.005 | 1.867 | -4.13 |
| 3.926990816987158 | 3.937 | 1.963 | -4.2 |
| 3.933274002294337 | 3.868 | 2.061 | -4.267 |
| 3.939557187601517 | 3.798 | 2.158 | -4.334 |
| 3.945840372908697 | 3.728 | 2.256 | -4.4 |
| 3.952123558215876 | 3.657 | 2.353 | -4.465 |
| 3.958406743523056 | 3.586 | 2.452 | -4.528 |
| 3.964689928830236 | 3.514 | 2.55 | -4.59 |
| 3.970973114137415 | 3.441 | 2.648 | -4.651 |
| 3.977256299444595 | 3.368 | 2.747 | -4.711 |
| 3.983539484751775 | 3.294 | 2.846 | -4.769 |
| 3.989822670058954 | 3.219 | 2.945 | -4.826 |
| 3.996105855366134 | 3.144 | 3.045 | -4.881 |
| 4.002389040673314 | 3.068 | 3.144 | -4.935 |
| 4.008672225980493 | 2.991 | 3.244 | -4.988 |
| 4.014955411287672 | 2.914 | 3.343 | -5.039 |
| 4.021238596594851 | 2.836 | 3.443 | -5.089 |
| 4.02752178190203 | 2.757 | 3.543 | -5.137 |
| 4.03380496720921 | 2.678 | 3.643 | -5.184 |
| 4.040088152516389 | 2.598 | 3.743 | -5.229 |
| 4.046371337823567 | 2.517 | 3.843 | -5.272 |
| 4.052654523130747 | 2.436 | 3.943 | -5.314 |
| 4.058937708437926 | 2.354 | 4.043 | -5.354 |
| 4.065220893745105 | 2.272 | 4.143 | -5.393 |
| 4.071504079052285 | 2.189 | 4.242 | -5.429 |
| 4.077787264359464 | 2.105 | 4.342 | -5.464 |
| 4.084070449666643 | 2.02 | 4.442 | -5.498 |
| 4.090353634973822 | 1.935 | 4.542 | -5.529 |
| 4.096636820281001 | 1.849 | 4.641 | -5.559 |
| 4.102920005588181 | 1.763 | 4.74 | -5.587 |
| 4.10920319089536 | 1.676 | 4.84 | -5.613 |
| 4.115486376202539 | 1.588 | 4.939 | -5.637 |
| 4.121769561509718 | 1.5 | 5.038 | -5.659 |
| 4.128052746816897 | 1.411 | 5.136 | -5.68 |
| 4.134335932124077 | 1.321 | 5.235 | -5.698 |
| 4.140619117431256 | 1.231 | 5.333 | -5.715 |
| 4.146902302738435 | 1.14 | 5.431 | -5.729 |
| 4.153185488045614 | 1.049 | 5.528 | -5.742 |
| 4.159468673352793 | 0.956 | 5.626 | -5.752 |
| 4.165751858659973 | 0.864 | 5.723 | -5.761 |
| 4.172035043967152 | 0.77 | 5.819 | -5.767 |
| 4.178318229274331 | 0.676 | 5.916 | -5.772 |
| 4.18460141458151 | 0.581 | 6.012 | -5.774 |
| 4.190884599888689 | 0.486 | 6.107 | -5.774 |
| 4.197167785195868 | 0.39 | 6.202 | -5.773 |
| 4.203450970503048 | 0.293 | 6.297 | -5.769 |
| 4.209734155810227 | 0.196 | 6.391 | -5.763 |
| 4.216017341117406 | 0.098 | 6.485 | -5.755 |
| 4.222300526424585 | 0 | 6.578 | -5.745 |
| 4.228583711731764 | -0.1 | 6.671 | -5.732 |
| 4.234866897038944 | -0.199 | 6.763 | -5.718 |
| 4.241150082346122 | -0.3 | 6.855 | -5.701 |
| 4.247433267653302 | -0.401 | 6.946 | -5.683 |
| 4.253716452960481 | -0.502 | 7.037 | -5.662 |
| 4.25999963826766 | -0.605 | 7.127 | -5.639 |
| 4.26628282357484 | -0.707 | 7.216 | -5.613 |
| 4.272566008882019 | -0.811 | 7.305 | -5.586 |
| 4.278849194189198 | -0.915 | 7.393 | -5.556 |
| 4.285132379496377 | -1.02 | 7.48 | -5.524 |
| 4.291415564803557 | -1.125 | 7.567 | -5.491 |
| 4.297698750110735 | -1.231 | 7.653 | -5.454 |
| 4.303981935417915 | -1.337 | 7.738 | -5.416 |
| 4.310265120725094 | -1.445 | 7.822 | -5.376 |
| 4.316548306032273 | -1.552 | 7.906 | -5.333 |
| 4.322831491339452 | -1.661 | 7.989 | -5.288 |
| 4.329114676646632 | -1.769 | 8.071 | -5.241 |
| 4.335397861953811 | -1.879 | 8.152 | -5.192 |
| 4.34168104726099 | -1.989 | 8.233 | -5.14 |
| 4.347964232568169 | -2.1 | 8.312 | -5.087 |
| 4.354247417875348 | -2.211 | 8.391 | -5.031 |
| 4.360530603182528 | -2.323 | 8.469 | -4.973 |
| 4.366813788489707 | -2.435 | 8.546 | -4.913 |
| 4.373096973796886 | -2.548 | 8.622 | -4.851 |
| 4.379380159104065 | -2.662 | 8.696 | -4.787 |
| 4.385663344411244 | -2.776 | 8.77 | -4.721 |
| 4.391946529718424 | -2.891 | 8.843 | -4.653 |
| 4.398229715025602 | -3.006 | 8.915 | -4.582 |
| 4.404512900332782 | -3.122 | 8.986 | -4.51 |
| 4.41079608563996 | -3.239 | 9.056 | -4.435 |
| 4.41707927094714 | -3.356 | 9.125 | -4.359 |
| 4.42336245625432 | -3.473 | 9.193 | -4.28 |
| 4.429645641561499 | -3.591 | 9.259 | -4.2 |
| 4.435928826868678 | -3.71 | 9.325 | -4.117 |
| 4.442212012175857 | -3.829 | 9.389 | -4.033 |
| 4.448495197483036 | -3.949 | 9.452 | -3.946 |
| 4.454778382790215 | -4.069 | 9.514 | -3.858 |
| 4.461061568097395 | -4.19 | 9.575 | -3.768 |
| 4.467344753404574 | -4.311 | 9.635 | -3.676 |
| 4.473627938711753 | -4.433 | 9.693 | -3.582 |
| 4.479911124018932 | -4.556 | 9.75 | -3.486 |
| 4.486194309326112 | -4.679 | 9.806 | -3.388 |
| 4.49247749463329 | -4.802 | 9.861 | -3.289 |
| 4.49876067994047 | -4.926 | 9.914 | -3.188 |
| 4.50504386524765 | -5.051 | 9.966 | -3.085 |
| 4.511327050554828 | -5.176 | 10.017 | -2.981 |
| 4.517610235862008 | -5.301 | 10.066 | -2.875 |
| 4.523893421169186 | -5.427 | 10.114 | -2.767 |
| 4.530176606476366 | -5.554 | 10.161 | -2.657 |
| 4.536459791783545 | -5.681 | 10.206 | -2.547 |
| 4.542742977090724 | -5.809 | 10.25 | -2.434 |
| 4.549026162397904 | -5.937 | 10.293 | -2.32 |
| 4.555309347705083 | -6.065 | 10.334 | -2.205 |
| 4.561592533012262 | -6.194 | 10.373 | -2.088 |
| 4.567875718319441 | -6.324 | 10.411 | -1.969 |
| 4.57415890362662 | -6.454 | 10.448 | -1.85 |
| 4.5804420889338 | -6.584 | 10.483 | -1.729 |
| 4.586725274240979 | -6.715 | 10.517 | -1.607 |
| 4.593008459548158 | -6.846 | 10.549 | -1.483 |
| 4.599291644855337 | -6.978 | 10.579 | -1.358 |
| 4.605574830162516 | -7.111 | 10.608 | -1.232 |
| 4.611858015469695 | -7.243 | 10.636 | -1.105 |
| 4.618141200776875 | -7.376 | 10.662 | -0.977 |
| 4.624424386084054 | -7.51 | 10.686 | -0.848 |
| 4.630707571391233 | -7.644 | 10.709 | -0.718 |
| 4.636990756698412 | -7.779 | 10.73 | -0.587 |
| 4.643273942005591 | -7.914 | 10.749 | -0.454 |
| 4.649557127312771 | -8.049 | 10.767 | -0.321 |
| 4.65584031261995 | -8.185 | 10.783 | -0.188 |
| 4.66212349792713 | -8.321 | 10.798 | -0.053 |
| 4.668406683234308 | -8.457 | 10.811 | 0.082 |
| 4.674689868541487 | -8.594 | 10.822 | 0.218 |
| 4.680973053848666 | -8.732 | 10.832 | 0.355 |
| 4.687256239155846 | -8.87 | 10.839 | 0.493 |
| 4.693539424463024 | -9.008 | 10.845 | 0.631 |
| 4.699822609770204 | -9.146 | 10.85 | 0.769 |
| 4.706105795077383 | -9.285 | 10.852 | 0.908 |
| 4.712388980384562 | -9.425 | 10.853 | 1.047 |
| 4.718672165691741 | -9.564 | 10.852 | 1.187 |
| 4.724955350998921 | -9.705 | 10.85 | 1.327 |
| 4.7312385363061 | -9.845 | 10.845 | 1.467 |
| 4.73752172161328 | -9.986 | 10.839 | 1.608 |
| 4.743804906920459 | -10.127 | 10.831 | 1.748 |
| 4.750088092227637 | -10.268 | 10.821 | 1.889 |
| 4.756371277534817 | -10.41 | 10.81 | 2.03 |
| 4.762654462841996 | -10.552 | 10.796 | 2.171 |
| 4.768937648149175 | -10.695 | 10.781 | 2.312 |
| 4.775220833456354 | -10.838 | 10.764 | 2.453 |
| 4.781504018763534 | -10.981 | 10.745 | 2.593 |
| 4.787787204070713 | -11.124 | 10.725 | 2.734 |
| 4.794070389377892 | -11.268 | 10.702 | 2.874 |
| 4.800353574685071 | -11.412 | 10.678 | 3.014 |
| 4.806636759992251 | -11.557 | 10.651 | 3.154 |
| 4.81291994529943 | -11.701 | 10.623 | 3.293 |
| 4.819203130606608 | -11.846 | 10.593 | 3.432 |
| 4.825486315913788 | -11.991 | 10.561 | 3.57 |
| 4.831769501220967 | -12.137 | 10.528 | 3.707 |
| 4.838052686528146 | -12.283 | 10.492 | 3.845 |
| 4.844335871835326 | -12.429 | 10.454 | 3.981 |
| 4.850619057142505 | -12.575 | 10.415 | 4.117 |
| 4.856902242449684 | -12.722 | 10.374 | 4.252 |
| 4.863185427756863 | -12.868 | 10.331 | 4.386 |
| 4.869468613064042 | -13.015 | 10.285 | 4.519 |
| 4.875751798371221 | -13.163 | 10.238 | 4.651 |
| 4.882034983678401 | -13.31 | 10.19 | 4.782 |
| 4.88831816898558 | -13.458 | 10.139 | 4.913 |
| 4.894601354292759 | -13.606 | 10.086 | 5.042 |
| 4.900884539599939 | -13.754 | 10.031 | 5.17 |
| 4.907167724907117 | -13.902 | 9.975 | 5.297 |
| 4.913450910214297 | -14.051 | 9.917 | 5.422 |
| 4.919734095521476 | -14.2 | 9.856 | 5.546 |
| 4.926017280828655 | -14.349 | 9.794 | 5.669 |
| 4.932300466135834 | -14.498 | 9.73 | 5.791 |
| 4.938583651443014 | -14.647 | 9.664 | 5.911 |
| 4.944866836750193 | -14.796 | 9.596 | 6.029 |
| 4.951150022057372 | -14.946 | 9.526 | 6.146 |
| 4.957433207364551 | -15.096 | 9.454 | 6.262 |
| 4.96371639267173 | -15.246 | 9.381 | 6.375 |
| 4.96999957797891 | -15.396 | 9.305 | 6.487 |
| 4.976282763286088 | -15.546 | 9.228 | 6.598 |
| 4.982565948593268 | -15.696 | 9.148 | 6.706 |
| 4.988849133900447 | -15.846 | 9.067 | 6.813 |
| 4.995132319207626 | -15.997 | 8.984 | 6.917 |
| 5.001415504514805 | -16.147 | 8.899 | 7.02 |
| 5.007698689821984 | -16.298 | 8.812 | 7.121 |
| 5.013981875129164 | -16.449 | 8.724 | 7.219 |
| 5.020265060436343 | -16.6 | 8.633 | 7.316 |
| 5.026548245743522 | -16.751 | 8.541 | 7.41 |
| 5.032831431050702 | -16.902 | 8.447 | 7.502 |
| 5.039114616357881 | -17.053 | 8.351 | 7.592 |
| 5.04539780166506 | -17.204 | 8.253 | 7.68 |
| 5.05168098697224 | -17.355 | 8.153 | 7.766 |
| 5.057964172279418 | -17.506 | 8.051 | 7.849 |
| 5.064247357586598 | -17.658 | 7.948 | 7.929 |
| 5.070530542893777 | -17.809 | 7.843 | 8.007 |
| 5.076813728200956 | -17.96 | 7.736 | 8.083 |
| 5.083096913508135 | -18.111 | 7.627 | 8.156 |
| 5.089380098815314 | -18.263 | 7.517 | 8.227 |
| 5.095663284122493 | -18.414 | 7.404 | 8.295 |
| 5.101946469429673 | -18.565 | 7.29 | 8.36 |
| 5.108229654736852 | -18.717 | 7.174 | 8.423 |
| 5.114512840044031 | -18.868 | 7.057 | 8.483 |
| 5.12079602535121 | -19.019 | 6.938 | 8.54 |
| 5.12707921065839 | -19.17 | 6.817 | 8.594 |
| 5.133362395965568 | -19.322 | 6.694 | 8.646 |
| 5.139645581272747 | -19.473 | 6.57 | 8.695 |
| 5.145928766579927 | -19.624 | 6.444 | 8.74 |
| 5.152211951887106 | -19.775 | 6.316 | 8.783 |
| 5.158495137194286 | -19.925 | 6.187 | 8.823 |
| 5.164778322501465 | -20.076 | 6.056 | 8.86 |
| 5.171061507808644 | -20.227 | 5.923 | 8.894 |
| 5.177344693115823 | -20.378 | 5.789 | 8.925 |
| 5.183627878423002 | -20.528 | 5.653 | 8.953 |
| 5.189911063730181 | -20.678 | 5.516 | 8.978 |
| 5.196194249037361 | -20.829 | 5.377 | 9 |
| 5.20247743434454 | -20.979 | 5.236 | 9.019 |
| 5.20876061965172 | -21.129 | 5.094 | 9.034 |
| 5.215043804958898 | -21.279 | 4.951 | 9.047 |
| 5.221326990266077 | -21.428 | 4.806 | 9.056 |
| 5.227610175573257 | -21.578 | 4.659 | 9.062 |
| 5.233893360880435 | -21.727 | 4.511 | 9.064 |
| 5.240176546187615 | -21.876 | 4.362 | 9.064 |
| 5.246459731494794 | -22.025 | 4.211 | 9.06 |
| 5.252742916801973 | -22.174 | 4.059 | 9.053 |
| 5.259026102109152 | -22.322 | 3.905 | 9.043 |
| 5.265309287416332 | -22.471 | 3.75 | 9.029 |
| 5.27159247272351 | -22.619 | 3.594 | 9.012 |
| 5.27787565803069 | -22.767 | 3.436 | 8.992 |
| 5.284158843337869 | -22.914 | 3.277 | 8.968 |
| 5.290442028645049 | -23.062 | 3.117 | 8.941 |
| 5.296725213952227 | -23.209 | 2.955 | 8.911 |
| 5.303008399259407 | -23.356 | 2.792 | 8.877 |
| 5.309291584566586 | -23.503 | 2.628 | 8.84 |
| 5.315574769873765 | -23.649 | 2.463 | 8.8 |
| 5.321857955180945 | -23.795 | 2.296 | 8.756 |
| 5.328141140488124 | -23.941 | 2.129 | 8.709 |
| 5.334424325795303 | -24.086 | 1.96 | 8.659 |
| 5.340707511102482 | -24.231 | 1.79 | 8.605 |
| 5.346990696409661 | -24.376 | 1.619 | 8.548 |
| 5.35327388171684 | -24.521 | 1.447 | 8.488 |
| 5.35955706702402 | -24.665 | 1.274 | 8.424 |
| 5.365840252331199 | -24.809 | 1.1 | 8.357 |
| 5.372123437638378 | -24.952 | 0.925 | 8.287 |
| 5.378406622945557 | -25.095 | 0.749 | 8.213 |
| 5.384689808252737 | -25.238 | 0.572 | 8.136 |
| 5.390972993559916 | -25.38 | 0.394 | 8.056 |
| 5.397256178867095 | -25.522 | 0.215 | 7.972 |
| 5.403539364174274 | -25.664 | 0.035 | 7.885 |
| 5.409822549481453 | -25.805 | -0.146 | 7.795 |
| 5.416105734788632 | -25.946 | -0.327 | 7.702 |
| 5.422388920095812 | -26.086 | -0.509 | 7.606 |
| 5.42867210540299 | -26.226 | -0.693 | 7.506 |
| 5.43495529071017 | -26.365 | -0.876 | 7.404 |
| 5.44123847601735 | -26.504 | -1.061 | 7.298 |
| 5.447521661324528 | -26.643 | -1.246 | 7.189 |
| 5.453804846631708 | -26.781 | -1.432 | 7.077 |
| 5.460088031938887 | -26.919 | -1.618 | 6.961 |
| 5.466371217246066 | -27.056 | -1.805 | 6.843 |
| 5.472654402553245 | -27.192 | -1.993 | 6.722 |
| 5.478937587860424 | -27.328 | -2.181 | 6.598 |
| 5.485220773167603 | -27.464 | -2.37 | 6.471 |
| 5.491503958474783 | -27.599 | -2.559 | 6.341 |
| 5.497787143781962 | -27.734 | -2.749 | 6.208 |
| 5.504070329089141 | -27.868 | -2.939 | 6.072 |
| 5.51035351439632 | -28.001 | -3.13 | 5.934 |
| 5.5166366997035 | -28.134 | -3.32 | 5.793 |
| 5.522919885010679 | -28.266 | -3.512 | 5.649 |
| 5.529203070317858 | -28.398 | -3.703 | 5.502 |
| 5.535486255625037 | -28.529 | -3.895 | 5.353 |
| 5.541769440932216 | -28.66 | -4.087 | 5.201 |
| 5.548052626239396 | -28.79 | -4.28 | 5.046 |
| 5.554335811546575 | -28.919 | -4.472 | 4.889 |
| 5.560618996853754 | -29.048 | -4.665 | 4.73 |
| 5.566902182160933 | -29.176 | -4.858 | 4.568 |
| 5.573185367468112 | -29.304 | -5.05 | 4.403 |
| 5.579468552775292 | -29.431 | -5.243 | 4.237 |
| 5.585751738082471 | -29.557 | -5.436 | 4.068 |
| 5.59203492338965 | -29.683 | -5.629 | 3.897 |
| 5.59831810869683 | -29.807 | -5.822 | 3.724 |
| 5.604601294004008 | -29.932 | -6.015 | 3.548 |
| 5.610884479311188 | -30.055 | -6.208 | 3.371 |
| 5.617167664618367 | -30.178 | -6.401 | 3.191 |
| 5.623450849925546 | -30.3 | -6.593 | 3.01 |
| 5.629734035232725 | -30.422 | -6.786 | 2.827 |
| 5.636017220539904 | -30.542 | -6.978 | 2.642 |
| 5.642300405847083 | -30.662 | -7.17 | 2.455 |
| 5.648583591154263 | -30.782 | -7.361 | 2.266 |
| 5.654866776461442 | -30.9 | -7.553 | 2.076 |
| 5.661149961768621 | -31.018 | -7.743 | 1.884 |
| 5.6674331470758 | -31.135 | -7.934 | 1.691 |
| 5.673716332382979 | -31.251 | -8.124 | 1.496 |
| 5.679999517690159 | -31.366 | -8.314 | 1.299 |
| 5.686282702997337 | -31.481 | -8.503 | 1.102 |
| 5.692565888304517 | -31.595 | -8.692 | 0.903 |
| 5.698849073611696 | -31.708 | -8.88 | 0.703 |
| 5.705132258918875 | -31.82 | -9.067 | 0.502 |
| 5.711415444226055 | -31.931 | -9.254 | 0.299 |
| 5.717698629533234 | -32.042 | -9.44 | 0.096 |
| 5.723981814840413 | -32.151 | -9.626 | -0.108 |
| 5.730265000147592 | -32.26 | -9.81 | -0.313 |
| 5.73654818545477 | -32.368 | -9.994 | -0.519 |
| 5.742831370761951 | -32.475 | -10.178 | -0.726 |
| 5.74911455606913 | -32.581 | -10.36 | -0.933 |
| 5.75539774137631 | -32.686 | -10.542 | -1.141 |
| 5.761680926683488 | -32.791 | -10.722 | -1.349 |
| 5.767964111990667 | -32.894 | -10.902 | -1.558 |
| 5.774247297297846 | -32.997 | -11.081 | -1.767 |
| 5.780530482605025 | -33.098 | -11.259 | -1.977 |
| 5.786813667912205 | -33.199 | -11.435 | -2.186 |
| 5.793096853219384 | -33.299 | -11.611 | -2.396 |
| 5.799380038526563 | -33.398 | -11.786 | -2.606 |
| 5.805663223833742 | -33.495 | -11.959 | -2.816 |
| 5.811946409140922 | -33.592 | -12.131 | -3.025 |
| 5.8182295944481 | -33.688 | -12.302 | -3.235 |
| 5.82451277975528 | -33.783 | -12.472 | -3.444 |
| 5.830795965062459 | -33.877 | -12.641 | -3.653 |
| 5.837079150369638 | -33.97 | -12.808 | -3.862 |
| 5.843362335676817 | -34.062 | -12.974 | -4.07 |
| 5.849645520983997 | -34.152 | -13.139 | -4.277 |
| 5.855928706291176 | -34.242 | -13.302 | -4.484 |
| 5.862211891598355 | -34.331 | -13.464 | -4.69 |
| 5.868495076905535 | -34.419 | -13.624 | -4.896 |
| 5.874778262212714 | -34.505 | -13.783 | -5.1 |
| 5.881061447519893 | -34.591 | -13.94 | -5.304 |
| 5.887344632827072 | -34.675 | -14.096 | -5.506 |
| 5.893627818134251 | -34.759 | -14.25 | -5.708 |
| 5.899911003441431 | -34.841 | -14.403 | -5.908 |
| 5.90619418874861 | -34.922 | -14.554 | -6.107 |
| 5.912477374055789 | -35.003 | -14.703 | -6.305 |
| 5.918760559362968 | -35.082 | -14.85 | -6.501 |
| 5.925043744670147 | -35.159 | -14.996 | -6.695 |
| 5.931326929977326 | -35.236 | -15.14 | -6.889 |
| 5.937610115284505 | -35.312 | -15.282 | -7.08 |
| 5.943893300591684 | -35.386 | -15.422 | -7.27 |
| 5.950176485898864 | -35.46 | -15.561 | -7.458 |
| 5.956459671206043 | -35.532 | -15.697 | -7.644 |
| 5.962742856513223 | -35.603 | -15.832 | -7.828 |
| 5.969026041820402 | -35.672 | -15.964 | -8.01 |
| 5.975309227127581 | -35.741 | -16.095 | -8.19 |
| 5.98159241243476 | -35.808 | -16.223 | -8.368 |
| 5.987875597741939 | -35.875 | -16.35 | -8.544 |
| 5.994158783049118 | -35.939 | -16.474 | -8.717 |
| 6.000441968356298 | -36.003 | -16.597 | -8.888 |
| 6.006725153663476 | -36.066 | -16.717 | -9.057 |
| 6.013008338970656 | -36.127 | -16.835 | -9.223 |
| 6.019291524277835 | -36.187 | -16.951 | -9.386 |
| 6.025574709585015 | -36.246 | -17.064 | -9.546 |
| 6.031857894892193 | -36.303 | -17.175 | -9.704 |
| 6.038141080199372 | -36.359 | -17.284 | -9.859 |
| 6.044424265506552 | -36.414 | -17.391 | -10.012 |
| 6.050707450813731 | -36.468 | -17.495 | -10.161 |
| 6.05699063612091 | -36.52 | -17.597 | -10.307 |
| 6.06327382142809 | -36.571 | -17.697 | -10.45 |
| 6.069557006735269 | -36.621 | -17.794 | -10.59 |
| 6.075840192042448 | -36.67 | -17.889 | -10.727 |
| 6.082123377349627 | -36.717 | -17.981 | -10.86 |
| 6.088406562656806 | -36.762 | -18.071 | -10.991 |
| 6.094689747963986 | -36.807 | -18.158 | -11.117 |
| 6.100972933271164 | -36.85 | -18.242 | -11.241 |
| 6.107256118578344 | -36.892 | -18.324 | -11.361 |
| 6.113539303885523 | -36.932 | -18.404 | -11.477 |
| 6.119822489192702 | -36.971 | -18.481 | -11.589 |
| 6.126105674499882 | -37.008 | -18.555 | -11.698 |
| 6.132388859807061 | -37.045 | -18.626 | -11.803 |
| 6.13867204511424 | -37.079 | -18.695 | -11.905 |
| 6.144955230421419 | -37.113 | -18.761 | -12.002 |
| 6.151238415728598 | -37.145 | -18.825 | -12.096 |
| 6.157521601035778 | -37.175 | -18.885 | -12.186 |
| 6.163804786342957 | -37.204 | -18.943 | -12.271 |
| 6.170087971650136 | -37.232 | -18.998 | -12.353 |
| 6.176371156957315 | -37.258 | -19.051 | -12.431 |
| 6.182654342264494 | -37.283 | -19.1 | -12.504 |
| 6.188937527571674 | -37.307 | -19.147 | -12.573 |
| 6.195220712878853 | -37.329 | -19.19 | -12.638 |
| 6.201503898186032 | -37.349 | -19.231 | -12.699 |
| 6.207787083493211 | -37.368 | -19.269 | -12.756 |
| 6.21407026880039 | -37.386 | -19.304 | -12.808 |
| 6.22035345410757 | -37.402 | -19.336 | -12.855 |
| 6.226636639414749 | -37.416 | -19.365 | -12.899 |
| 6.232919824721928 | -37.429 | -19.391 | -12.938 |
| 6.239203010029107 | -37.441 | -19.414 | -12.972 |
| 6.245486195336286 | -37.451 | -19.434 | -13.002 |
| 6.251769380643465 | -37.459 | -19.451 | -13.027 |
| 6.258052565950644 | -37.466 | -19.464 | -13.048 |
| 6.264335751257824 | -37.471 | -19.475 | -13.064 |
| 6.270618936565003 | -37.475 | -19.483 | -13.076 |
| 6.276902121872182 | -37.478 | -19.488 | -13.083 |
| 6.283185307179361 | -37.478 | -19.489 | -13.085 |